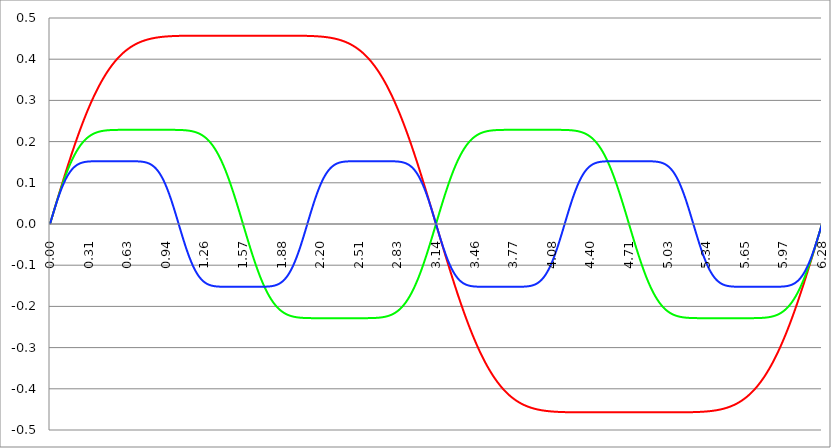
| Category | Series 1 | Series 0 | Series 2 |
|---|---|---|---|
| 0.0 | 0 | 0 | 0 |
| 0.00314159265358979 | 0.003 | 0.003 | 0.003 |
| 0.00628318530717958 | 0.006 | 0.006 | 0.006 |
| 0.00942477796076938 | 0.009 | 0.009 | 0.009 |
| 0.0125663706143592 | 0.013 | 0.013 | 0.013 |
| 0.015707963267949 | 0.016 | 0.016 | 0.016 |
| 0.0188495559215388 | 0.019 | 0.019 | 0.019 |
| 0.0219911485751285 | 0.022 | 0.022 | 0.022 |
| 0.0251327412287183 | 0.025 | 0.025 | 0.025 |
| 0.0282743338823081 | 0.028 | 0.028 | 0.028 |
| 0.0314159265358979 | 0.031 | 0.031 | 0.031 |
| 0.0345575191894877 | 0.035 | 0.034 | 0.034 |
| 0.0376991118430775 | 0.038 | 0.037 | 0.037 |
| 0.0408407044966673 | 0.041 | 0.041 | 0.04 |
| 0.0439822971502571 | 0.044 | 0.044 | 0.043 |
| 0.0471238898038469 | 0.047 | 0.047 | 0.046 |
| 0.0502654824574367 | 0.05 | 0.05 | 0.049 |
| 0.0534070751110265 | 0.053 | 0.053 | 0.052 |
| 0.0565486677646163 | 0.056 | 0.056 | 0.055 |
| 0.059690260418206 | 0.059 | 0.059 | 0.058 |
| 0.0628318530717958 | 0.063 | 0.062 | 0.06 |
| 0.0659734457253856 | 0.066 | 0.065 | 0.063 |
| 0.0691150383789754 | 0.069 | 0.068 | 0.066 |
| 0.0722566310325652 | 0.072 | 0.071 | 0.068 |
| 0.075398223686155 | 0.075 | 0.073 | 0.071 |
| 0.0785398163397448 | 0.078 | 0.076 | 0.074 |
| 0.0816814089933346 | 0.081 | 0.079 | 0.076 |
| 0.0848230016469244 | 0.084 | 0.082 | 0.079 |
| 0.0879645943005142 | 0.087 | 0.085 | 0.081 |
| 0.091106186954104 | 0.09 | 0.088 | 0.084 |
| 0.0942477796076937 | 0.093 | 0.09 | 0.086 |
| 0.0973893722612835 | 0.096 | 0.093 | 0.088 |
| 0.100530964914873 | 0.099 | 0.096 | 0.091 |
| 0.103672557568463 | 0.102 | 0.099 | 0.093 |
| 0.106814150222053 | 0.105 | 0.101 | 0.095 |
| 0.109955742875643 | 0.108 | 0.104 | 0.097 |
| 0.113097335529233 | 0.111 | 0.107 | 0.099 |
| 0.116238928182822 | 0.114 | 0.109 | 0.102 |
| 0.119380520836412 | 0.117 | 0.112 | 0.104 |
| 0.122522113490002 | 0.12 | 0.114 | 0.105 |
| 0.125663706143592 | 0.123 | 0.117 | 0.107 |
| 0.128805298797181 | 0.126 | 0.119 | 0.109 |
| 0.131946891450771 | 0.129 | 0.122 | 0.111 |
| 0.135088484104361 | 0.132 | 0.124 | 0.113 |
| 0.138230076757951 | 0.135 | 0.127 | 0.115 |
| 0.141371669411541 | 0.138 | 0.129 | 0.116 |
| 0.14451326206513 | 0.141 | 0.131 | 0.118 |
| 0.14765485471872 | 0.144 | 0.134 | 0.119 |
| 0.15079644737231 | 0.147 | 0.136 | 0.121 |
| 0.1539380400259 | 0.15 | 0.138 | 0.122 |
| 0.15707963267949 | 0.153 | 0.141 | 0.124 |
| 0.160221225333079 | 0.156 | 0.143 | 0.125 |
| 0.163362817986669 | 0.158 | 0.145 | 0.127 |
| 0.166504410640259 | 0.161 | 0.147 | 0.128 |
| 0.169646003293849 | 0.164 | 0.149 | 0.129 |
| 0.172787595947439 | 0.167 | 0.151 | 0.13 |
| 0.175929188601028 | 0.17 | 0.153 | 0.131 |
| 0.179070781254618 | 0.173 | 0.155 | 0.132 |
| 0.182212373908208 | 0.175 | 0.157 | 0.134 |
| 0.185353966561798 | 0.178 | 0.159 | 0.135 |
| 0.188495559215388 | 0.181 | 0.161 | 0.136 |
| 0.191637151868977 | 0.184 | 0.163 | 0.136 |
| 0.194778744522567 | 0.186 | 0.165 | 0.137 |
| 0.197920337176157 | 0.189 | 0.167 | 0.138 |
| 0.201061929829747 | 0.192 | 0.168 | 0.139 |
| 0.204203522483336 | 0.195 | 0.17 | 0.14 |
| 0.207345115136926 | 0.197 | 0.172 | 0.141 |
| 0.210486707790516 | 0.2 | 0.173 | 0.141 |
| 0.213628300444106 | 0.203 | 0.175 | 0.142 |
| 0.216769893097696 | 0.205 | 0.177 | 0.143 |
| 0.219911485751285 | 0.208 | 0.178 | 0.143 |
| 0.223053078404875 | 0.211 | 0.18 | 0.144 |
| 0.226194671058465 | 0.213 | 0.181 | 0.144 |
| 0.229336263712055 | 0.216 | 0.183 | 0.145 |
| 0.232477856365645 | 0.219 | 0.184 | 0.145 |
| 0.235619449019234 | 0.221 | 0.186 | 0.146 |
| 0.238761041672824 | 0.224 | 0.187 | 0.146 |
| 0.241902634326414 | 0.226 | 0.188 | 0.147 |
| 0.245044226980004 | 0.229 | 0.19 | 0.147 |
| 0.248185819633594 | 0.231 | 0.191 | 0.148 |
| 0.251327412287183 | 0.234 | 0.192 | 0.148 |
| 0.254469004940773 | 0.236 | 0.194 | 0.148 |
| 0.257610597594363 | 0.239 | 0.195 | 0.149 |
| 0.260752190247953 | 0.241 | 0.196 | 0.149 |
| 0.263893782901543 | 0.244 | 0.197 | 0.149 |
| 0.267035375555132 | 0.246 | 0.198 | 0.149 |
| 0.270176968208722 | 0.249 | 0.199 | 0.15 |
| 0.273318560862312 | 0.251 | 0.2 | 0.15 |
| 0.276460153515902 | 0.254 | 0.201 | 0.15 |
| 0.279601746169492 | 0.256 | 0.202 | 0.15 |
| 0.282743338823082 | 0.258 | 0.203 | 0.15 |
| 0.285884931476671 | 0.261 | 0.204 | 0.151 |
| 0.289026524130261 | 0.263 | 0.205 | 0.151 |
| 0.292168116783851 | 0.265 | 0.206 | 0.151 |
| 0.295309709437441 | 0.268 | 0.207 | 0.151 |
| 0.298451302091031 | 0.27 | 0.208 | 0.151 |
| 0.30159289474462 | 0.272 | 0.209 | 0.151 |
| 0.30473448739821 | 0.274 | 0.209 | 0.151 |
| 0.3078760800518 | 0.277 | 0.21 | 0.152 |
| 0.31101767270539 | 0.279 | 0.211 | 0.152 |
| 0.31415926535898 | 0.281 | 0.212 | 0.152 |
| 0.31730085801257 | 0.283 | 0.212 | 0.152 |
| 0.320442450666159 | 0.286 | 0.213 | 0.152 |
| 0.323584043319749 | 0.288 | 0.214 | 0.152 |
| 0.326725635973339 | 0.29 | 0.214 | 0.152 |
| 0.329867228626929 | 0.292 | 0.215 | 0.152 |
| 0.333008821280519 | 0.294 | 0.216 | 0.152 |
| 0.336150413934108 | 0.296 | 0.216 | 0.152 |
| 0.339292006587698 | 0.298 | 0.217 | 0.152 |
| 0.342433599241288 | 0.3 | 0.217 | 0.152 |
| 0.345575191894878 | 0.302 | 0.218 | 0.152 |
| 0.348716784548468 | 0.305 | 0.218 | 0.152 |
| 0.351858377202058 | 0.307 | 0.219 | 0.152 |
| 0.354999969855647 | 0.309 | 0.219 | 0.152 |
| 0.358141562509237 | 0.311 | 0.22 | 0.152 |
| 0.361283155162827 | 0.313 | 0.22 | 0.152 |
| 0.364424747816417 | 0.314 | 0.22 | 0.152 |
| 0.367566340470007 | 0.316 | 0.221 | 0.152 |
| 0.370707933123597 | 0.318 | 0.221 | 0.152 |
| 0.373849525777186 | 0.32 | 0.222 | 0.152 |
| 0.376991118430776 | 0.322 | 0.222 | 0.152 |
| 0.380132711084366 | 0.324 | 0.222 | 0.152 |
| 0.383274303737956 | 0.326 | 0.223 | 0.152 |
| 0.386415896391546 | 0.328 | 0.223 | 0.152 |
| 0.389557489045135 | 0.33 | 0.223 | 0.152 |
| 0.392699081698725 | 0.331 | 0.223 | 0.152 |
| 0.395840674352315 | 0.333 | 0.224 | 0.152 |
| 0.398982267005905 | 0.335 | 0.224 | 0.152 |
| 0.402123859659495 | 0.337 | 0.224 | 0.152 |
| 0.405265452313085 | 0.338 | 0.225 | 0.152 |
| 0.408407044966674 | 0.34 | 0.225 | 0.152 |
| 0.411548637620264 | 0.342 | 0.225 | 0.152 |
| 0.414690230273854 | 0.344 | 0.225 | 0.152 |
| 0.417831822927444 | 0.345 | 0.225 | 0.152 |
| 0.420973415581034 | 0.347 | 0.226 | 0.152 |
| 0.424115008234623 | 0.349 | 0.226 | 0.152 |
| 0.427256600888213 | 0.35 | 0.226 | 0.152 |
| 0.430398193541803 | 0.352 | 0.226 | 0.152 |
| 0.433539786195393 | 0.353 | 0.226 | 0.152 |
| 0.436681378848983 | 0.355 | 0.226 | 0.152 |
| 0.439822971502573 | 0.357 | 0.226 | 0.152 |
| 0.442964564156162 | 0.358 | 0.227 | 0.152 |
| 0.446106156809752 | 0.36 | 0.227 | 0.152 |
| 0.449247749463342 | 0.361 | 0.227 | 0.152 |
| 0.452389342116932 | 0.363 | 0.227 | 0.152 |
| 0.455530934770522 | 0.364 | 0.227 | 0.152 |
| 0.458672527424111 | 0.366 | 0.227 | 0.152 |
| 0.461814120077701 | 0.367 | 0.227 | 0.152 |
| 0.464955712731291 | 0.369 | 0.227 | 0.152 |
| 0.468097305384881 | 0.37 | 0.227 | 0.152 |
| 0.471238898038471 | 0.371 | 0.228 | 0.152 |
| 0.474380490692061 | 0.373 | 0.228 | 0.152 |
| 0.47752208334565 | 0.374 | 0.228 | 0.152 |
| 0.48066367599924 | 0.376 | 0.228 | 0.152 |
| 0.48380526865283 | 0.377 | 0.228 | 0.152 |
| 0.48694686130642 | 0.378 | 0.228 | 0.152 |
| 0.49008845396001 | 0.38 | 0.228 | 0.152 |
| 0.493230046613599 | 0.381 | 0.228 | 0.152 |
| 0.496371639267189 | 0.382 | 0.228 | 0.152 |
| 0.499513231920779 | 0.383 | 0.228 | 0.152 |
| 0.502654824574369 | 0.385 | 0.228 | 0.152 |
| 0.505796417227959 | 0.386 | 0.228 | 0.152 |
| 0.508938009881549 | 0.387 | 0.228 | 0.152 |
| 0.512079602535138 | 0.388 | 0.228 | 0.152 |
| 0.515221195188728 | 0.39 | 0.228 | 0.152 |
| 0.518362787842318 | 0.391 | 0.228 | 0.152 |
| 0.521504380495908 | 0.392 | 0.228 | 0.152 |
| 0.524645973149498 | 0.393 | 0.228 | 0.152 |
| 0.527787565803087 | 0.394 | 0.228 | 0.152 |
| 0.530929158456677 | 0.395 | 0.228 | 0.152 |
| 0.534070751110267 | 0.396 | 0.228 | 0.152 |
| 0.537212343763857 | 0.397 | 0.228 | 0.152 |
| 0.540353936417447 | 0.399 | 0.228 | 0.152 |
| 0.543495529071037 | 0.4 | 0.228 | 0.152 |
| 0.546637121724626 | 0.401 | 0.228 | 0.152 |
| 0.549778714378216 | 0.402 | 0.228 | 0.152 |
| 0.552920307031806 | 0.403 | 0.228 | 0.152 |
| 0.556061899685396 | 0.404 | 0.228 | 0.152 |
| 0.559203492338986 | 0.405 | 0.228 | 0.152 |
| 0.562345084992576 | 0.406 | 0.228 | 0.152 |
| 0.565486677646165 | 0.407 | 0.228 | 0.152 |
| 0.568628270299755 | 0.408 | 0.229 | 0.152 |
| 0.571769862953345 | 0.409 | 0.229 | 0.152 |
| 0.574911455606935 | 0.409 | 0.229 | 0.152 |
| 0.578053048260525 | 0.41 | 0.229 | 0.152 |
| 0.581194640914114 | 0.411 | 0.229 | 0.152 |
| 0.584336233567704 | 0.412 | 0.229 | 0.152 |
| 0.587477826221294 | 0.413 | 0.229 | 0.152 |
| 0.590619418874884 | 0.414 | 0.229 | 0.152 |
| 0.593761011528474 | 0.415 | 0.229 | 0.152 |
| 0.596902604182064 | 0.416 | 0.229 | 0.152 |
| 0.600044196835653 | 0.416 | 0.229 | 0.152 |
| 0.603185789489243 | 0.417 | 0.229 | 0.152 |
| 0.606327382142833 | 0.418 | 0.229 | 0.152 |
| 0.609468974796423 | 0.419 | 0.229 | 0.152 |
| 0.612610567450013 | 0.42 | 0.229 | 0.152 |
| 0.615752160103602 | 0.42 | 0.229 | 0.152 |
| 0.618893752757192 | 0.421 | 0.229 | 0.152 |
| 0.622035345410782 | 0.422 | 0.229 | 0.152 |
| 0.625176938064372 | 0.423 | 0.229 | 0.152 |
| 0.628318530717962 | 0.423 | 0.229 | 0.152 |
| 0.631460123371551 | 0.424 | 0.229 | 0.152 |
| 0.634601716025141 | 0.425 | 0.229 | 0.152 |
| 0.637743308678731 | 0.425 | 0.229 | 0.152 |
| 0.640884901332321 | 0.426 | 0.229 | 0.152 |
| 0.644026493985911 | 0.427 | 0.229 | 0.152 |
| 0.647168086639501 | 0.427 | 0.229 | 0.152 |
| 0.65030967929309 | 0.428 | 0.229 | 0.152 |
| 0.65345127194668 | 0.429 | 0.229 | 0.152 |
| 0.65659286460027 | 0.429 | 0.229 | 0.152 |
| 0.65973445725386 | 0.43 | 0.229 | 0.152 |
| 0.66287604990745 | 0.431 | 0.229 | 0.152 |
| 0.666017642561039 | 0.431 | 0.229 | 0.152 |
| 0.669159235214629 | 0.432 | 0.229 | 0.152 |
| 0.672300827868219 | 0.432 | 0.229 | 0.152 |
| 0.675442420521809 | 0.433 | 0.229 | 0.152 |
| 0.678584013175399 | 0.433 | 0.229 | 0.152 |
| 0.681725605828989 | 0.434 | 0.229 | 0.152 |
| 0.684867198482578 | 0.434 | 0.229 | 0.152 |
| 0.688008791136168 | 0.435 | 0.229 | 0.152 |
| 0.691150383789758 | 0.435 | 0.229 | 0.152 |
| 0.694291976443348 | 0.436 | 0.229 | 0.152 |
| 0.697433569096938 | 0.436 | 0.229 | 0.152 |
| 0.700575161750528 | 0.437 | 0.229 | 0.152 |
| 0.703716754404117 | 0.437 | 0.229 | 0.152 |
| 0.706858347057707 | 0.438 | 0.229 | 0.152 |
| 0.709999939711297 | 0.438 | 0.229 | 0.152 |
| 0.713141532364887 | 0.439 | 0.229 | 0.152 |
| 0.716283125018477 | 0.439 | 0.229 | 0.152 |
| 0.719424717672066 | 0.44 | 0.229 | 0.152 |
| 0.722566310325656 | 0.44 | 0.229 | 0.152 |
| 0.725707902979246 | 0.441 | 0.229 | 0.152 |
| 0.728849495632836 | 0.441 | 0.229 | 0.152 |
| 0.731991088286426 | 0.441 | 0.229 | 0.152 |
| 0.735132680940016 | 0.442 | 0.229 | 0.152 |
| 0.738274273593605 | 0.442 | 0.229 | 0.152 |
| 0.741415866247195 | 0.442 | 0.229 | 0.151 |
| 0.744557458900785 | 0.443 | 0.229 | 0.151 |
| 0.747699051554375 | 0.443 | 0.229 | 0.151 |
| 0.750840644207965 | 0.444 | 0.229 | 0.151 |
| 0.753982236861554 | 0.444 | 0.229 | 0.151 |
| 0.757123829515144 | 0.444 | 0.229 | 0.151 |
| 0.760265422168734 | 0.445 | 0.229 | 0.151 |
| 0.763407014822324 | 0.445 | 0.229 | 0.151 |
| 0.766548607475914 | 0.445 | 0.229 | 0.15 |
| 0.769690200129504 | 0.446 | 0.229 | 0.15 |
| 0.772831792783093 | 0.446 | 0.229 | 0.15 |
| 0.775973385436683 | 0.446 | 0.229 | 0.15 |
| 0.779114978090273 | 0.446 | 0.229 | 0.15 |
| 0.782256570743863 | 0.447 | 0.229 | 0.149 |
| 0.785398163397453 | 0.447 | 0.229 | 0.149 |
| 0.788539756051042 | 0.447 | 0.229 | 0.149 |
| 0.791681348704632 | 0.448 | 0.229 | 0.148 |
| 0.794822941358222 | 0.448 | 0.229 | 0.148 |
| 0.797964534011812 | 0.448 | 0.229 | 0.148 |
| 0.801106126665402 | 0.448 | 0.229 | 0.147 |
| 0.804247719318992 | 0.449 | 0.229 | 0.147 |
| 0.807389311972581 | 0.449 | 0.229 | 0.147 |
| 0.810530904626171 | 0.449 | 0.229 | 0.146 |
| 0.813672497279761 | 0.449 | 0.229 | 0.146 |
| 0.816814089933351 | 0.449 | 0.229 | 0.145 |
| 0.819955682586941 | 0.45 | 0.229 | 0.145 |
| 0.823097275240531 | 0.45 | 0.229 | 0.144 |
| 0.82623886789412 | 0.45 | 0.229 | 0.144 |
| 0.82938046054771 | 0.45 | 0.229 | 0.143 |
| 0.8325220532013 | 0.451 | 0.229 | 0.142 |
| 0.83566364585489 | 0.451 | 0.229 | 0.142 |
| 0.83880523850848 | 0.451 | 0.229 | 0.141 |
| 0.841946831162069 | 0.451 | 0.229 | 0.14 |
| 0.845088423815659 | 0.451 | 0.229 | 0.139 |
| 0.848230016469249 | 0.451 | 0.229 | 0.139 |
| 0.851371609122839 | 0.452 | 0.229 | 0.138 |
| 0.854513201776429 | 0.452 | 0.229 | 0.137 |
| 0.857654794430019 | 0.452 | 0.229 | 0.136 |
| 0.860796387083608 | 0.452 | 0.229 | 0.135 |
| 0.863937979737198 | 0.452 | 0.229 | 0.134 |
| 0.867079572390788 | 0.452 | 0.229 | 0.133 |
| 0.870221165044378 | 0.453 | 0.229 | 0.132 |
| 0.873362757697968 | 0.453 | 0.229 | 0.131 |
| 0.876504350351557 | 0.453 | 0.229 | 0.129 |
| 0.879645943005147 | 0.453 | 0.229 | 0.128 |
| 0.882787535658737 | 0.453 | 0.229 | 0.127 |
| 0.885929128312327 | 0.453 | 0.229 | 0.126 |
| 0.889070720965917 | 0.453 | 0.229 | 0.124 |
| 0.892212313619507 | 0.453 | 0.229 | 0.123 |
| 0.895353906273096 | 0.454 | 0.229 | 0.121 |
| 0.898495498926686 | 0.454 | 0.229 | 0.12 |
| 0.901637091580276 | 0.454 | 0.229 | 0.118 |
| 0.904778684233866 | 0.454 | 0.229 | 0.117 |
| 0.907920276887456 | 0.454 | 0.229 | 0.115 |
| 0.911061869541045 | 0.454 | 0.229 | 0.113 |
| 0.914203462194635 | 0.454 | 0.229 | 0.112 |
| 0.917345054848225 | 0.454 | 0.229 | 0.11 |
| 0.920486647501815 | 0.454 | 0.229 | 0.108 |
| 0.923628240155405 | 0.455 | 0.229 | 0.106 |
| 0.926769832808995 | 0.455 | 0.229 | 0.104 |
| 0.929911425462584 | 0.455 | 0.229 | 0.102 |
| 0.933053018116174 | 0.455 | 0.229 | 0.1 |
| 0.936194610769764 | 0.455 | 0.229 | 0.098 |
| 0.939336203423354 | 0.455 | 0.229 | 0.096 |
| 0.942477796076944 | 0.455 | 0.229 | 0.094 |
| 0.945619388730533 | 0.455 | 0.229 | 0.091 |
| 0.948760981384123 | 0.455 | 0.229 | 0.089 |
| 0.951902574037713 | 0.455 | 0.229 | 0.087 |
| 0.955044166691303 | 0.455 | 0.229 | 0.085 |
| 0.958185759344893 | 0.455 | 0.229 | 0.082 |
| 0.961327351998483 | 0.455 | 0.229 | 0.08 |
| 0.964468944652072 | 0.456 | 0.229 | 0.077 |
| 0.967610537305662 | 0.456 | 0.229 | 0.075 |
| 0.970752129959252 | 0.456 | 0.229 | 0.072 |
| 0.973893722612842 | 0.456 | 0.229 | 0.069 |
| 0.977035315266432 | 0.456 | 0.229 | 0.067 |
| 0.980176907920022 | 0.456 | 0.229 | 0.064 |
| 0.983318500573611 | 0.456 | 0.229 | 0.061 |
| 0.986460093227201 | 0.456 | 0.229 | 0.058 |
| 0.989601685880791 | 0.456 | 0.229 | 0.056 |
| 0.992743278534381 | 0.456 | 0.229 | 0.053 |
| 0.995884871187971 | 0.456 | 0.229 | 0.05 |
| 0.99902646384156 | 0.456 | 0.229 | 0.047 |
| 1.00216805649515 | 0.456 | 0.229 | 0.044 |
| 1.00530964914874 | 0.456 | 0.228 | 0.041 |
| 1.00845124180233 | 0.456 | 0.228 | 0.038 |
| 1.01159283445592 | 0.456 | 0.228 | 0.035 |
| 1.01473442710951 | 0.456 | 0.228 | 0.032 |
| 1.017876019763099 | 0.456 | 0.228 | 0.029 |
| 1.021017612416689 | 0.456 | 0.228 | 0.026 |
| 1.02415920507028 | 0.456 | 0.228 | 0.023 |
| 1.027300797723869 | 0.456 | 0.228 | 0.02 |
| 1.030442390377459 | 0.456 | 0.228 | 0.017 |
| 1.033583983031048 | 0.456 | 0.228 | 0.014 |
| 1.036725575684638 | 0.457 | 0.228 | 0.01 |
| 1.039867168338228 | 0.457 | 0.228 | 0.007 |
| 1.043008760991818 | 0.457 | 0.228 | 0.004 |
| 1.046150353645408 | 0.457 | 0.228 | 0.001 |
| 1.049291946298998 | 0.457 | 0.228 | -0.002 |
| 1.052433538952587 | 0.457 | 0.228 | -0.005 |
| 1.055575131606177 | 0.457 | 0.228 | -0.008 |
| 1.058716724259767 | 0.457 | 0.228 | -0.012 |
| 1.061858316913357 | 0.457 | 0.228 | -0.015 |
| 1.064999909566947 | 0.457 | 0.228 | -0.018 |
| 1.068141502220536 | 0.457 | 0.228 | -0.021 |
| 1.071283094874126 | 0.457 | 0.228 | -0.024 |
| 1.074424687527716 | 0.457 | 0.228 | -0.027 |
| 1.077566280181306 | 0.457 | 0.228 | -0.03 |
| 1.080707872834896 | 0.457 | 0.228 | -0.033 |
| 1.083849465488486 | 0.457 | 0.228 | -0.036 |
| 1.086991058142075 | 0.457 | 0.228 | -0.039 |
| 1.090132650795665 | 0.457 | 0.228 | -0.042 |
| 1.093274243449255 | 0.457 | 0.228 | -0.045 |
| 1.096415836102845 | 0.457 | 0.228 | -0.048 |
| 1.099557428756435 | 0.457 | 0.228 | -0.051 |
| 1.102699021410025 | 0.457 | 0.227 | -0.054 |
| 1.105840614063614 | 0.457 | 0.227 | -0.057 |
| 1.108982206717204 | 0.457 | 0.227 | -0.059 |
| 1.112123799370794 | 0.457 | 0.227 | -0.062 |
| 1.115265392024384 | 0.457 | 0.227 | -0.065 |
| 1.118406984677974 | 0.457 | 0.227 | -0.068 |
| 1.121548577331563 | 0.457 | 0.227 | -0.07 |
| 1.124690169985153 | 0.457 | 0.227 | -0.073 |
| 1.127831762638743 | 0.457 | 0.227 | -0.075 |
| 1.130973355292333 | 0.457 | 0.226 | -0.078 |
| 1.134114947945923 | 0.457 | 0.226 | -0.08 |
| 1.137256540599513 | 0.457 | 0.226 | -0.083 |
| 1.140398133253102 | 0.457 | 0.226 | -0.085 |
| 1.143539725906692 | 0.457 | 0.226 | -0.088 |
| 1.146681318560282 | 0.457 | 0.226 | -0.09 |
| 1.149822911213872 | 0.457 | 0.226 | -0.092 |
| 1.152964503867462 | 0.457 | 0.225 | -0.094 |
| 1.156106096521051 | 0.457 | 0.225 | -0.097 |
| 1.159247689174641 | 0.457 | 0.225 | -0.099 |
| 1.162389281828231 | 0.457 | 0.225 | -0.101 |
| 1.165530874481821 | 0.457 | 0.225 | -0.103 |
| 1.168672467135411 | 0.457 | 0.224 | -0.105 |
| 1.171814059789001 | 0.457 | 0.224 | -0.107 |
| 1.17495565244259 | 0.457 | 0.224 | -0.109 |
| 1.17809724509618 | 0.457 | 0.223 | -0.11 |
| 1.18123883774977 | 0.457 | 0.223 | -0.112 |
| 1.18438043040336 | 0.457 | 0.223 | -0.114 |
| 1.18752202305695 | 0.457 | 0.223 | -0.116 |
| 1.190663615710539 | 0.457 | 0.222 | -0.117 |
| 1.193805208364129 | 0.457 | 0.222 | -0.119 |
| 1.19694680101772 | 0.457 | 0.222 | -0.12 |
| 1.200088393671309 | 0.457 | 0.221 | -0.122 |
| 1.203229986324899 | 0.457 | 0.221 | -0.123 |
| 1.206371578978489 | 0.457 | 0.22 | -0.125 |
| 1.209513171632078 | 0.457 | 0.22 | -0.126 |
| 1.212654764285668 | 0.457 | 0.22 | -0.127 |
| 1.215796356939258 | 0.457 | 0.219 | -0.129 |
| 1.218937949592848 | 0.457 | 0.219 | -0.13 |
| 1.222079542246438 | 0.457 | 0.218 | -0.131 |
| 1.225221134900027 | 0.457 | 0.218 | -0.132 |
| 1.228362727553617 | 0.457 | 0.217 | -0.133 |
| 1.231504320207207 | 0.457 | 0.217 | -0.134 |
| 1.234645912860797 | 0.457 | 0.216 | -0.135 |
| 1.237787505514387 | 0.457 | 0.216 | -0.136 |
| 1.240929098167977 | 0.457 | 0.215 | -0.137 |
| 1.244070690821566 | 0.457 | 0.214 | -0.138 |
| 1.247212283475156 | 0.457 | 0.214 | -0.139 |
| 1.250353876128746 | 0.457 | 0.213 | -0.14 |
| 1.253495468782336 | 0.457 | 0.212 | -0.14 |
| 1.256637061435926 | 0.457 | 0.212 | -0.141 |
| 1.259778654089515 | 0.457 | 0.211 | -0.142 |
| 1.262920246743105 | 0.457 | 0.21 | -0.142 |
| 1.266061839396695 | 0.457 | 0.209 | -0.143 |
| 1.269203432050285 | 0.457 | 0.209 | -0.144 |
| 1.272345024703875 | 0.457 | 0.208 | -0.144 |
| 1.275486617357465 | 0.457 | 0.207 | -0.145 |
| 1.278628210011054 | 0.457 | 0.206 | -0.145 |
| 1.281769802664644 | 0.457 | 0.205 | -0.146 |
| 1.284911395318234 | 0.457 | 0.204 | -0.146 |
| 1.288052987971824 | 0.457 | 0.203 | -0.147 |
| 1.291194580625414 | 0.457 | 0.202 | -0.147 |
| 1.294336173279003 | 0.457 | 0.201 | -0.147 |
| 1.297477765932593 | 0.457 | 0.2 | -0.148 |
| 1.300619358586183 | 0.457 | 0.199 | -0.148 |
| 1.303760951239773 | 0.457 | 0.198 | -0.149 |
| 1.306902543893363 | 0.457 | 0.197 | -0.149 |
| 1.310044136546953 | 0.457 | 0.196 | -0.149 |
| 1.313185729200542 | 0.457 | 0.195 | -0.149 |
| 1.316327321854132 | 0.457 | 0.194 | -0.15 |
| 1.319468914507722 | 0.457 | 0.192 | -0.15 |
| 1.322610507161312 | 0.457 | 0.191 | -0.15 |
| 1.325752099814902 | 0.457 | 0.19 | -0.15 |
| 1.328893692468491 | 0.457 | 0.188 | -0.15 |
| 1.332035285122081 | 0.457 | 0.187 | -0.151 |
| 1.335176877775671 | 0.457 | 0.186 | -0.151 |
| 1.338318470429261 | 0.457 | 0.184 | -0.151 |
| 1.341460063082851 | 0.457 | 0.183 | -0.151 |
| 1.344601655736441 | 0.457 | 0.181 | -0.151 |
| 1.34774324839003 | 0.457 | 0.18 | -0.151 |
| 1.35088484104362 | 0.457 | 0.178 | -0.151 |
| 1.35402643369721 | 0.457 | 0.177 | -0.151 |
| 1.3571680263508 | 0.457 | 0.175 | -0.152 |
| 1.36030961900439 | 0.457 | 0.173 | -0.152 |
| 1.363451211657979 | 0.457 | 0.172 | -0.152 |
| 1.36659280431157 | 0.457 | 0.17 | -0.152 |
| 1.369734396965159 | 0.457 | 0.168 | -0.152 |
| 1.372875989618749 | 0.457 | 0.167 | -0.152 |
| 1.376017582272339 | 0.457 | 0.165 | -0.152 |
| 1.379159174925929 | 0.457 | 0.163 | -0.152 |
| 1.382300767579518 | 0.457 | 0.161 | -0.152 |
| 1.385442360233108 | 0.457 | 0.159 | -0.152 |
| 1.388583952886698 | 0.457 | 0.157 | -0.152 |
| 1.391725545540288 | 0.457 | 0.155 | -0.152 |
| 1.394867138193878 | 0.457 | 0.153 | -0.152 |
| 1.398008730847468 | 0.457 | 0.151 | -0.152 |
| 1.401150323501057 | 0.457 | 0.149 | -0.152 |
| 1.404291916154647 | 0.457 | 0.147 | -0.152 |
| 1.407433508808237 | 0.457 | 0.145 | -0.152 |
| 1.410575101461827 | 0.457 | 0.143 | -0.152 |
| 1.413716694115417 | 0.457 | 0.141 | -0.152 |
| 1.416858286769006 | 0.457 | 0.138 | -0.152 |
| 1.419999879422596 | 0.457 | 0.136 | -0.152 |
| 1.423141472076186 | 0.457 | 0.134 | -0.152 |
| 1.426283064729776 | 0.457 | 0.131 | -0.152 |
| 1.429424657383366 | 0.457 | 0.129 | -0.152 |
| 1.432566250036956 | 0.457 | 0.127 | -0.152 |
| 1.435707842690545 | 0.457 | 0.124 | -0.152 |
| 1.438849435344135 | 0.457 | 0.122 | -0.152 |
| 1.441991027997725 | 0.457 | 0.119 | -0.152 |
| 1.445132620651315 | 0.457 | 0.117 | -0.152 |
| 1.448274213304905 | 0.457 | 0.114 | -0.152 |
| 1.451415805958494 | 0.457 | 0.112 | -0.152 |
| 1.454557398612084 | 0.457 | 0.109 | -0.152 |
| 1.457698991265674 | 0.457 | 0.107 | -0.152 |
| 1.460840583919264 | 0.457 | 0.104 | -0.152 |
| 1.463982176572854 | 0.457 | 0.101 | -0.152 |
| 1.467123769226444 | 0.457 | 0.099 | -0.152 |
| 1.470265361880033 | 0.457 | 0.096 | -0.152 |
| 1.473406954533623 | 0.457 | 0.093 | -0.152 |
| 1.476548547187213 | 0.457 | 0.09 | -0.152 |
| 1.479690139840803 | 0.457 | 0.088 | -0.152 |
| 1.482831732494393 | 0.457 | 0.085 | -0.152 |
| 1.485973325147982 | 0.457 | 0.082 | -0.152 |
| 1.489114917801572 | 0.457 | 0.079 | -0.152 |
| 1.492256510455162 | 0.457 | 0.076 | -0.152 |
| 1.495398103108752 | 0.457 | 0.073 | -0.152 |
| 1.498539695762342 | 0.457 | 0.071 | -0.152 |
| 1.501681288415932 | 0.457 | 0.068 | -0.152 |
| 1.504822881069521 | 0.457 | 0.065 | -0.152 |
| 1.507964473723111 | 0.457 | 0.062 | -0.152 |
| 1.511106066376701 | 0.457 | 0.059 | -0.152 |
| 1.514247659030291 | 0.457 | 0.056 | -0.152 |
| 1.517389251683881 | 0.457 | 0.053 | -0.152 |
| 1.520530844337471 | 0.457 | 0.05 | -0.152 |
| 1.52367243699106 | 0.457 | 0.047 | -0.152 |
| 1.52681402964465 | 0.457 | 0.044 | -0.152 |
| 1.52995562229824 | 0.457 | 0.041 | -0.152 |
| 1.53309721495183 | 0.457 | 0.037 | -0.152 |
| 1.53623880760542 | 0.457 | 0.034 | -0.152 |
| 1.539380400259009 | 0.457 | 0.031 | -0.152 |
| 1.542521992912599 | 0.457 | 0.028 | -0.152 |
| 1.545663585566189 | 0.457 | 0.025 | -0.152 |
| 1.548805178219779 | 0.457 | 0.022 | -0.152 |
| 1.551946770873369 | 0.457 | 0.019 | -0.152 |
| 1.555088363526959 | 0.457 | 0.016 | -0.152 |
| 1.558229956180548 | 0.457 | 0.013 | -0.152 |
| 1.561371548834138 | 0.457 | 0.009 | -0.152 |
| 1.564513141487728 | 0.457 | 0.006 | -0.152 |
| 1.567654734141318 | 0.457 | 0.003 | -0.152 |
| 1.570796326794908 | 0.457 | 0 | -0.152 |
| 1.573937919448497 | 0.457 | -0.003 | -0.152 |
| 1.577079512102087 | 0.457 | -0.006 | -0.152 |
| 1.580221104755677 | 0.457 | -0.009 | -0.152 |
| 1.583362697409267 | 0.457 | -0.013 | -0.152 |
| 1.586504290062857 | 0.457 | -0.016 | -0.152 |
| 1.589645882716447 | 0.457 | -0.019 | -0.152 |
| 1.592787475370036 | 0.457 | -0.022 | -0.152 |
| 1.595929068023626 | 0.457 | -0.025 | -0.152 |
| 1.599070660677216 | 0.457 | -0.028 | -0.152 |
| 1.602212253330806 | 0.457 | -0.031 | -0.152 |
| 1.605353845984396 | 0.457 | -0.034 | -0.152 |
| 1.608495438637985 | 0.457 | -0.037 | -0.152 |
| 1.611637031291575 | 0.457 | -0.041 | -0.152 |
| 1.614778623945165 | 0.457 | -0.044 | -0.152 |
| 1.617920216598755 | 0.457 | -0.047 | -0.152 |
| 1.621061809252345 | 0.457 | -0.05 | -0.152 |
| 1.624203401905935 | 0.457 | -0.053 | -0.152 |
| 1.627344994559524 | 0.457 | -0.056 | -0.152 |
| 1.630486587213114 | 0.457 | -0.059 | -0.152 |
| 1.633628179866704 | 0.457 | -0.062 | -0.152 |
| 1.636769772520294 | 0.457 | -0.065 | -0.152 |
| 1.639911365173884 | 0.457 | -0.068 | -0.152 |
| 1.643052957827473 | 0.457 | -0.071 | -0.152 |
| 1.646194550481063 | 0.457 | -0.073 | -0.152 |
| 1.649336143134653 | 0.457 | -0.076 | -0.152 |
| 1.652477735788243 | 0.457 | -0.079 | -0.152 |
| 1.655619328441833 | 0.457 | -0.082 | -0.152 |
| 1.658760921095423 | 0.457 | -0.085 | -0.152 |
| 1.661902513749012 | 0.457 | -0.088 | -0.152 |
| 1.665044106402602 | 0.457 | -0.09 | -0.152 |
| 1.668185699056192 | 0.457 | -0.093 | -0.152 |
| 1.671327291709782 | 0.457 | -0.096 | -0.152 |
| 1.674468884363372 | 0.457 | -0.099 | -0.152 |
| 1.677610477016961 | 0.457 | -0.101 | -0.152 |
| 1.680752069670551 | 0.457 | -0.104 | -0.152 |
| 1.683893662324141 | 0.457 | -0.107 | -0.152 |
| 1.687035254977731 | 0.457 | -0.109 | -0.152 |
| 1.690176847631321 | 0.457 | -0.112 | -0.152 |
| 1.693318440284911 | 0.457 | -0.114 | -0.152 |
| 1.6964600329385 | 0.457 | -0.117 | -0.152 |
| 1.69960162559209 | 0.457 | -0.119 | -0.152 |
| 1.70274321824568 | 0.457 | -0.122 | -0.152 |
| 1.70588481089927 | 0.457 | -0.124 | -0.152 |
| 1.70902640355286 | 0.457 | -0.127 | -0.152 |
| 1.712167996206449 | 0.457 | -0.129 | -0.152 |
| 1.715309588860039 | 0.457 | -0.131 | -0.152 |
| 1.71845118151363 | 0.457 | -0.134 | -0.152 |
| 1.721592774167219 | 0.457 | -0.136 | -0.152 |
| 1.724734366820809 | 0.457 | -0.138 | -0.152 |
| 1.727875959474399 | 0.457 | -0.141 | -0.152 |
| 1.731017552127988 | 0.457 | -0.143 | -0.152 |
| 1.734159144781578 | 0.457 | -0.145 | -0.152 |
| 1.737300737435168 | 0.457 | -0.147 | -0.152 |
| 1.740442330088758 | 0.457 | -0.149 | -0.152 |
| 1.743583922742348 | 0.457 | -0.151 | -0.152 |
| 1.746725515395937 | 0.457 | -0.153 | -0.152 |
| 1.749867108049527 | 0.457 | -0.155 | -0.152 |
| 1.753008700703117 | 0.457 | -0.157 | -0.152 |
| 1.756150293356707 | 0.457 | -0.159 | -0.152 |
| 1.759291886010297 | 0.457 | -0.161 | -0.152 |
| 1.762433478663887 | 0.457 | -0.163 | -0.152 |
| 1.765575071317476 | 0.457 | -0.165 | -0.152 |
| 1.768716663971066 | 0.457 | -0.167 | -0.152 |
| 1.771858256624656 | 0.457 | -0.168 | -0.152 |
| 1.774999849278246 | 0.457 | -0.17 | -0.152 |
| 1.778141441931836 | 0.457 | -0.172 | -0.152 |
| 1.781283034585426 | 0.457 | -0.173 | -0.152 |
| 1.784424627239015 | 0.457 | -0.175 | -0.152 |
| 1.787566219892605 | 0.457 | -0.177 | -0.151 |
| 1.790707812546195 | 0.457 | -0.178 | -0.151 |
| 1.793849405199785 | 0.457 | -0.18 | -0.151 |
| 1.796990997853375 | 0.457 | -0.181 | -0.151 |
| 1.800132590506964 | 0.457 | -0.183 | -0.151 |
| 1.803274183160554 | 0.457 | -0.184 | -0.151 |
| 1.806415775814144 | 0.457 | -0.186 | -0.151 |
| 1.809557368467734 | 0.457 | -0.187 | -0.151 |
| 1.812698961121324 | 0.457 | -0.188 | -0.15 |
| 1.815840553774914 | 0.457 | -0.19 | -0.15 |
| 1.818982146428503 | 0.457 | -0.191 | -0.15 |
| 1.822123739082093 | 0.457 | -0.192 | -0.15 |
| 1.825265331735683 | 0.457 | -0.194 | -0.15 |
| 1.828406924389273 | 0.457 | -0.195 | -0.149 |
| 1.831548517042863 | 0.457 | -0.196 | -0.149 |
| 1.834690109696452 | 0.457 | -0.197 | -0.149 |
| 1.837831702350042 | 0.457 | -0.198 | -0.149 |
| 1.840973295003632 | 0.457 | -0.199 | -0.148 |
| 1.844114887657222 | 0.457 | -0.2 | -0.148 |
| 1.847256480310812 | 0.457 | -0.201 | -0.147 |
| 1.850398072964402 | 0.457 | -0.202 | -0.147 |
| 1.853539665617991 | 0.457 | -0.203 | -0.147 |
| 1.856681258271581 | 0.457 | -0.204 | -0.146 |
| 1.859822850925171 | 0.457 | -0.205 | -0.146 |
| 1.862964443578761 | 0.457 | -0.206 | -0.145 |
| 1.866106036232351 | 0.457 | -0.207 | -0.145 |
| 1.86924762888594 | 0.457 | -0.208 | -0.144 |
| 1.87238922153953 | 0.457 | -0.209 | -0.144 |
| 1.87553081419312 | 0.457 | -0.209 | -0.143 |
| 1.87867240684671 | 0.457 | -0.21 | -0.142 |
| 1.8818139995003 | 0.457 | -0.211 | -0.142 |
| 1.88495559215389 | 0.457 | -0.212 | -0.141 |
| 1.888097184807479 | 0.457 | -0.212 | -0.14 |
| 1.891238777461069 | 0.457 | -0.213 | -0.14 |
| 1.89438037011466 | 0.457 | -0.214 | -0.139 |
| 1.897521962768249 | 0.457 | -0.214 | -0.138 |
| 1.900663555421839 | 0.457 | -0.215 | -0.137 |
| 1.903805148075429 | 0.457 | -0.216 | -0.136 |
| 1.906946740729018 | 0.457 | -0.216 | -0.135 |
| 1.910088333382608 | 0.457 | -0.217 | -0.134 |
| 1.913229926036198 | 0.457 | -0.217 | -0.133 |
| 1.916371518689788 | 0.457 | -0.218 | -0.132 |
| 1.919513111343378 | 0.457 | -0.218 | -0.131 |
| 1.922654703996967 | 0.457 | -0.219 | -0.13 |
| 1.925796296650557 | 0.457 | -0.219 | -0.129 |
| 1.928937889304147 | 0.457 | -0.22 | -0.127 |
| 1.932079481957737 | 0.457 | -0.22 | -0.126 |
| 1.935221074611327 | 0.457 | -0.22 | -0.125 |
| 1.938362667264917 | 0.457 | -0.221 | -0.123 |
| 1.941504259918506 | 0.457 | -0.221 | -0.122 |
| 1.944645852572096 | 0.457 | -0.222 | -0.12 |
| 1.947787445225686 | 0.457 | -0.222 | -0.119 |
| 1.950929037879276 | 0.457 | -0.222 | -0.117 |
| 1.954070630532866 | 0.457 | -0.223 | -0.116 |
| 1.957212223186455 | 0.457 | -0.223 | -0.114 |
| 1.960353815840045 | 0.457 | -0.223 | -0.112 |
| 1.963495408493635 | 0.457 | -0.223 | -0.11 |
| 1.966637001147225 | 0.457 | -0.224 | -0.109 |
| 1.969778593800815 | 0.457 | -0.224 | -0.107 |
| 1.972920186454405 | 0.457 | -0.224 | -0.105 |
| 1.976061779107994 | 0.457 | -0.225 | -0.103 |
| 1.979203371761584 | 0.457 | -0.225 | -0.101 |
| 1.982344964415174 | 0.457 | -0.225 | -0.099 |
| 1.985486557068764 | 0.457 | -0.225 | -0.097 |
| 1.988628149722354 | 0.457 | -0.225 | -0.094 |
| 1.991769742375943 | 0.457 | -0.226 | -0.092 |
| 1.994911335029533 | 0.457 | -0.226 | -0.09 |
| 1.998052927683123 | 0.457 | -0.226 | -0.088 |
| 2.001194520336712 | 0.457 | -0.226 | -0.085 |
| 2.004336112990302 | 0.457 | -0.226 | -0.083 |
| 2.007477705643892 | 0.457 | -0.226 | -0.08 |
| 2.010619298297482 | 0.457 | -0.226 | -0.078 |
| 2.013760890951071 | 0.457 | -0.227 | -0.075 |
| 2.016902483604661 | 0.457 | -0.227 | -0.073 |
| 2.02004407625825 | 0.457 | -0.227 | -0.07 |
| 2.02318566891184 | 0.457 | -0.227 | -0.068 |
| 2.02632726156543 | 0.457 | -0.227 | -0.065 |
| 2.029468854219019 | 0.457 | -0.227 | -0.062 |
| 2.032610446872609 | 0.457 | -0.227 | -0.059 |
| 2.035752039526198 | 0.457 | -0.227 | -0.057 |
| 2.038893632179788 | 0.457 | -0.227 | -0.054 |
| 2.042035224833378 | 0.457 | -0.228 | -0.051 |
| 2.045176817486967 | 0.457 | -0.228 | -0.048 |
| 2.048318410140557 | 0.457 | -0.228 | -0.045 |
| 2.051460002794146 | 0.457 | -0.228 | -0.042 |
| 2.054601595447736 | 0.457 | -0.228 | -0.039 |
| 2.057743188101325 | 0.457 | -0.228 | -0.036 |
| 2.060884780754915 | 0.457 | -0.228 | -0.033 |
| 2.064026373408505 | 0.457 | -0.228 | -0.03 |
| 2.067167966062094 | 0.457 | -0.228 | -0.027 |
| 2.070309558715684 | 0.457 | -0.228 | -0.024 |
| 2.073451151369273 | 0.457 | -0.228 | -0.021 |
| 2.076592744022863 | 0.457 | -0.228 | -0.018 |
| 2.079734336676452 | 0.457 | -0.228 | -0.015 |
| 2.082875929330042 | 0.457 | -0.228 | -0.012 |
| 2.086017521983632 | 0.457 | -0.228 | -0.008 |
| 2.089159114637221 | 0.457 | -0.228 | -0.005 |
| 2.092300707290811 | 0.457 | -0.228 | -0.002 |
| 2.095442299944401 | 0.457 | -0.228 | 0.001 |
| 2.09858389259799 | 0.457 | -0.228 | 0.004 |
| 2.10172548525158 | 0.457 | -0.228 | 0.007 |
| 2.104867077905169 | 0.457 | -0.228 | 0.01 |
| 2.108008670558759 | 0.456 | -0.228 | 0.014 |
| 2.111150263212349 | 0.456 | -0.228 | 0.017 |
| 2.114291855865938 | 0.456 | -0.228 | 0.02 |
| 2.117433448519528 | 0.456 | -0.228 | 0.023 |
| 2.120575041173117 | 0.456 | -0.228 | 0.026 |
| 2.123716633826707 | 0.456 | -0.228 | 0.029 |
| 2.126858226480297 | 0.456 | -0.228 | 0.032 |
| 2.129999819133886 | 0.456 | -0.228 | 0.035 |
| 2.133141411787476 | 0.456 | -0.228 | 0.038 |
| 2.136283004441065 | 0.456 | -0.228 | 0.041 |
| 2.139424597094655 | 0.456 | -0.229 | 0.044 |
| 2.142566189748245 | 0.456 | -0.229 | 0.047 |
| 2.145707782401834 | 0.456 | -0.229 | 0.05 |
| 2.148849375055424 | 0.456 | -0.229 | 0.053 |
| 2.151990967709013 | 0.456 | -0.229 | 0.056 |
| 2.155132560362603 | 0.456 | -0.229 | 0.058 |
| 2.158274153016193 | 0.456 | -0.229 | 0.061 |
| 2.161415745669782 | 0.456 | -0.229 | 0.064 |
| 2.164557338323372 | 0.456 | -0.229 | 0.067 |
| 2.167698930976961 | 0.456 | -0.229 | 0.069 |
| 2.170840523630551 | 0.456 | -0.229 | 0.072 |
| 2.173982116284141 | 0.456 | -0.229 | 0.075 |
| 2.17712370893773 | 0.456 | -0.229 | 0.077 |
| 2.18026530159132 | 0.455 | -0.229 | 0.08 |
| 2.183406894244909 | 0.455 | -0.229 | 0.082 |
| 2.186548486898499 | 0.455 | -0.229 | 0.085 |
| 2.189690079552089 | 0.455 | -0.229 | 0.087 |
| 2.192831672205678 | 0.455 | -0.229 | 0.089 |
| 2.195973264859268 | 0.455 | -0.229 | 0.091 |
| 2.199114857512857 | 0.455 | -0.229 | 0.094 |
| 2.202256450166447 | 0.455 | -0.229 | 0.096 |
| 2.205398042820036 | 0.455 | -0.229 | 0.098 |
| 2.208539635473626 | 0.455 | -0.229 | 0.1 |
| 2.211681228127216 | 0.455 | -0.229 | 0.102 |
| 2.214822820780805 | 0.455 | -0.229 | 0.104 |
| 2.217964413434395 | 0.455 | -0.229 | 0.106 |
| 2.221106006087984 | 0.454 | -0.229 | 0.108 |
| 2.224247598741574 | 0.454 | -0.229 | 0.11 |
| 2.227389191395164 | 0.454 | -0.229 | 0.112 |
| 2.230530784048753 | 0.454 | -0.229 | 0.113 |
| 2.233672376702343 | 0.454 | -0.229 | 0.115 |
| 2.236813969355933 | 0.454 | -0.229 | 0.117 |
| 2.239955562009522 | 0.454 | -0.229 | 0.118 |
| 2.243097154663112 | 0.454 | -0.229 | 0.12 |
| 2.246238747316701 | 0.454 | -0.229 | 0.121 |
| 2.249380339970291 | 0.453 | -0.229 | 0.123 |
| 2.252521932623881 | 0.453 | -0.229 | 0.124 |
| 2.25566352527747 | 0.453 | -0.229 | 0.126 |
| 2.25880511793106 | 0.453 | -0.229 | 0.127 |
| 2.261946710584649 | 0.453 | -0.229 | 0.128 |
| 2.265088303238239 | 0.453 | -0.229 | 0.129 |
| 2.268229895891829 | 0.453 | -0.229 | 0.131 |
| 2.271371488545418 | 0.453 | -0.229 | 0.132 |
| 2.274513081199008 | 0.452 | -0.229 | 0.133 |
| 2.277654673852597 | 0.452 | -0.229 | 0.134 |
| 2.280796266506186 | 0.452 | -0.229 | 0.135 |
| 2.283937859159776 | 0.452 | -0.229 | 0.136 |
| 2.287079451813366 | 0.452 | -0.229 | 0.137 |
| 2.290221044466955 | 0.452 | -0.229 | 0.138 |
| 2.293362637120545 | 0.451 | -0.229 | 0.139 |
| 2.296504229774135 | 0.451 | -0.229 | 0.139 |
| 2.299645822427724 | 0.451 | -0.229 | 0.14 |
| 2.302787415081314 | 0.451 | -0.229 | 0.141 |
| 2.305929007734904 | 0.451 | -0.229 | 0.142 |
| 2.309070600388493 | 0.451 | -0.229 | 0.142 |
| 2.312212193042083 | 0.45 | -0.229 | 0.143 |
| 2.315353785695672 | 0.45 | -0.229 | 0.144 |
| 2.318495378349262 | 0.45 | -0.229 | 0.144 |
| 2.321636971002852 | 0.45 | -0.229 | 0.145 |
| 2.324778563656441 | 0.449 | -0.229 | 0.145 |
| 2.327920156310031 | 0.449 | -0.229 | 0.146 |
| 2.33106174896362 | 0.449 | -0.229 | 0.146 |
| 2.33420334161721 | 0.449 | -0.229 | 0.147 |
| 2.3373449342708 | 0.449 | -0.229 | 0.147 |
| 2.340486526924389 | 0.448 | -0.229 | 0.147 |
| 2.343628119577979 | 0.448 | -0.229 | 0.148 |
| 2.346769712231568 | 0.448 | -0.229 | 0.148 |
| 2.349911304885158 | 0.448 | -0.229 | 0.148 |
| 2.353052897538748 | 0.447 | -0.229 | 0.149 |
| 2.356194490192337 | 0.447 | -0.229 | 0.149 |
| 2.359336082845927 | 0.447 | -0.229 | 0.149 |
| 2.362477675499516 | 0.446 | -0.229 | 0.15 |
| 2.365619268153106 | 0.446 | -0.229 | 0.15 |
| 2.368760860806696 | 0.446 | -0.229 | 0.15 |
| 2.371902453460285 | 0.446 | -0.229 | 0.15 |
| 2.375044046113875 | 0.445 | -0.229 | 0.15 |
| 2.378185638767464 | 0.445 | -0.229 | 0.151 |
| 2.381327231421054 | 0.445 | -0.229 | 0.151 |
| 2.384468824074644 | 0.444 | -0.229 | 0.151 |
| 2.387610416728233 | 0.444 | -0.229 | 0.151 |
| 2.390752009381823 | 0.444 | -0.229 | 0.151 |
| 2.393893602035412 | 0.443 | -0.229 | 0.151 |
| 2.397035194689002 | 0.443 | -0.229 | 0.151 |
| 2.400176787342591 | 0.442 | -0.229 | 0.151 |
| 2.403318379996181 | 0.442 | -0.229 | 0.152 |
| 2.406459972649771 | 0.442 | -0.229 | 0.152 |
| 2.40960156530336 | 0.441 | -0.229 | 0.152 |
| 2.41274315795695 | 0.441 | -0.229 | 0.152 |
| 2.41588475061054 | 0.441 | -0.229 | 0.152 |
| 2.419026343264129 | 0.44 | -0.229 | 0.152 |
| 2.422167935917719 | 0.44 | -0.229 | 0.152 |
| 2.425309528571308 | 0.439 | -0.229 | 0.152 |
| 2.428451121224898 | 0.439 | -0.229 | 0.152 |
| 2.431592713878488 | 0.438 | -0.229 | 0.152 |
| 2.434734306532077 | 0.438 | -0.229 | 0.152 |
| 2.437875899185667 | 0.437 | -0.229 | 0.152 |
| 2.441017491839256 | 0.437 | -0.229 | 0.152 |
| 2.444159084492846 | 0.436 | -0.229 | 0.152 |
| 2.447300677146435 | 0.436 | -0.229 | 0.152 |
| 2.450442269800025 | 0.435 | -0.229 | 0.152 |
| 2.453583862453615 | 0.435 | -0.229 | 0.152 |
| 2.456725455107204 | 0.434 | -0.229 | 0.152 |
| 2.459867047760794 | 0.434 | -0.229 | 0.152 |
| 2.463008640414384 | 0.433 | -0.229 | 0.152 |
| 2.466150233067973 | 0.433 | -0.229 | 0.152 |
| 2.469291825721563 | 0.432 | -0.229 | 0.152 |
| 2.472433418375152 | 0.432 | -0.229 | 0.152 |
| 2.475575011028742 | 0.431 | -0.229 | 0.152 |
| 2.478716603682332 | 0.431 | -0.229 | 0.152 |
| 2.481858196335921 | 0.43 | -0.229 | 0.152 |
| 2.48499978898951 | 0.429 | -0.229 | 0.152 |
| 2.4881413816431 | 0.429 | -0.229 | 0.152 |
| 2.49128297429669 | 0.428 | -0.229 | 0.152 |
| 2.49442456695028 | 0.427 | -0.229 | 0.152 |
| 2.497566159603869 | 0.427 | -0.229 | 0.152 |
| 2.500707752257458 | 0.426 | -0.229 | 0.152 |
| 2.503849344911048 | 0.425 | -0.229 | 0.152 |
| 2.506990937564638 | 0.425 | -0.229 | 0.152 |
| 2.510132530218228 | 0.424 | -0.229 | 0.152 |
| 2.513274122871817 | 0.423 | -0.229 | 0.152 |
| 2.516415715525407 | 0.423 | -0.229 | 0.152 |
| 2.519557308178996 | 0.422 | -0.229 | 0.152 |
| 2.522698900832586 | 0.421 | -0.229 | 0.152 |
| 2.525840493486176 | 0.42 | -0.229 | 0.152 |
| 2.528982086139765 | 0.42 | -0.229 | 0.152 |
| 2.532123678793355 | 0.419 | -0.229 | 0.152 |
| 2.535265271446944 | 0.418 | -0.229 | 0.152 |
| 2.538406864100534 | 0.417 | -0.229 | 0.152 |
| 2.541548456754124 | 0.416 | -0.229 | 0.152 |
| 2.544690049407713 | 0.416 | -0.229 | 0.152 |
| 2.547831642061302 | 0.415 | -0.229 | 0.152 |
| 2.550973234714892 | 0.414 | -0.229 | 0.152 |
| 2.554114827368482 | 0.413 | -0.229 | 0.152 |
| 2.557256420022072 | 0.412 | -0.229 | 0.152 |
| 2.560398012675661 | 0.411 | -0.229 | 0.152 |
| 2.563539605329251 | 0.41 | -0.229 | 0.152 |
| 2.56668119798284 | 0.409 | -0.229 | 0.152 |
| 2.56982279063643 | 0.409 | -0.229 | 0.152 |
| 2.57296438329002 | 0.408 | -0.229 | 0.152 |
| 2.576105975943609 | 0.407 | -0.228 | 0.152 |
| 2.579247568597199 | 0.406 | -0.228 | 0.152 |
| 2.582389161250788 | 0.405 | -0.228 | 0.152 |
| 2.585530753904377 | 0.404 | -0.228 | 0.152 |
| 2.588672346557967 | 0.403 | -0.228 | 0.152 |
| 2.591813939211557 | 0.402 | -0.228 | 0.152 |
| 2.594955531865147 | 0.401 | -0.228 | 0.152 |
| 2.598097124518736 | 0.4 | -0.228 | 0.152 |
| 2.601238717172326 | 0.399 | -0.228 | 0.152 |
| 2.604380309825915 | 0.397 | -0.228 | 0.152 |
| 2.607521902479505 | 0.396 | -0.228 | 0.152 |
| 2.610663495133095 | 0.395 | -0.228 | 0.152 |
| 2.613805087786684 | 0.394 | -0.228 | 0.152 |
| 2.616946680440274 | 0.393 | -0.228 | 0.152 |
| 2.620088273093863 | 0.392 | -0.228 | 0.152 |
| 2.623229865747452 | 0.391 | -0.228 | 0.152 |
| 2.626371458401042 | 0.39 | -0.228 | 0.152 |
| 2.629513051054632 | 0.388 | -0.228 | 0.152 |
| 2.632654643708222 | 0.387 | -0.228 | 0.152 |
| 2.635796236361811 | 0.386 | -0.228 | 0.152 |
| 2.638937829015401 | 0.385 | -0.228 | 0.152 |
| 2.642079421668991 | 0.383 | -0.228 | 0.152 |
| 2.64522101432258 | 0.382 | -0.228 | 0.152 |
| 2.64836260697617 | 0.381 | -0.228 | 0.152 |
| 2.651504199629759 | 0.38 | -0.228 | 0.152 |
| 2.654645792283349 | 0.378 | -0.228 | 0.152 |
| 2.657787384936938 | 0.377 | -0.228 | 0.152 |
| 2.660928977590528 | 0.376 | -0.228 | 0.152 |
| 2.664070570244118 | 0.374 | -0.228 | 0.152 |
| 2.667212162897707 | 0.373 | -0.228 | 0.152 |
| 2.670353755551297 | 0.371 | -0.228 | 0.152 |
| 2.673495348204887 | 0.37 | -0.227 | 0.152 |
| 2.676636940858476 | 0.369 | -0.227 | 0.152 |
| 2.679778533512066 | 0.367 | -0.227 | 0.152 |
| 2.682920126165655 | 0.366 | -0.227 | 0.152 |
| 2.686061718819245 | 0.364 | -0.227 | 0.152 |
| 2.689203311472835 | 0.363 | -0.227 | 0.152 |
| 2.692344904126424 | 0.361 | -0.227 | 0.152 |
| 2.695486496780014 | 0.36 | -0.227 | 0.152 |
| 2.698628089433603 | 0.358 | -0.227 | 0.152 |
| 2.701769682087193 | 0.357 | -0.226 | 0.152 |
| 2.704911274740782 | 0.355 | -0.226 | 0.152 |
| 2.708052867394372 | 0.353 | -0.226 | 0.152 |
| 2.711194460047962 | 0.352 | -0.226 | 0.152 |
| 2.714336052701551 | 0.35 | -0.226 | 0.152 |
| 2.717477645355141 | 0.349 | -0.226 | 0.152 |
| 2.720619238008731 | 0.347 | -0.226 | 0.152 |
| 2.72376083066232 | 0.345 | -0.225 | 0.152 |
| 2.72690242331591 | 0.344 | -0.225 | 0.152 |
| 2.730044015969499 | 0.342 | -0.225 | 0.152 |
| 2.733185608623089 | 0.34 | -0.225 | 0.152 |
| 2.736327201276678 | 0.338 | -0.225 | 0.152 |
| 2.739468793930268 | 0.337 | -0.224 | 0.152 |
| 2.742610386583858 | 0.335 | -0.224 | 0.152 |
| 2.745751979237447 | 0.333 | -0.224 | 0.152 |
| 2.748893571891036 | 0.331 | -0.223 | 0.152 |
| 2.752035164544627 | 0.33 | -0.223 | 0.152 |
| 2.755176757198216 | 0.328 | -0.223 | 0.152 |
| 2.758318349851806 | 0.326 | -0.223 | 0.152 |
| 2.761459942505395 | 0.324 | -0.222 | 0.152 |
| 2.764601535158985 | 0.322 | -0.222 | 0.152 |
| 2.767743127812574 | 0.32 | -0.222 | 0.152 |
| 2.770884720466164 | 0.318 | -0.221 | 0.152 |
| 2.774026313119754 | 0.316 | -0.221 | 0.152 |
| 2.777167905773343 | 0.314 | -0.22 | 0.152 |
| 2.780309498426932 | 0.313 | -0.22 | 0.152 |
| 2.783451091080522 | 0.311 | -0.22 | 0.152 |
| 2.786592683734112 | 0.309 | -0.219 | 0.152 |
| 2.789734276387701 | 0.307 | -0.219 | 0.152 |
| 2.792875869041291 | 0.305 | -0.218 | 0.152 |
| 2.796017461694881 | 0.302 | -0.218 | 0.152 |
| 2.79915905434847 | 0.3 | -0.217 | 0.152 |
| 2.80230064700206 | 0.298 | -0.217 | 0.152 |
| 2.80544223965565 | 0.296 | -0.216 | 0.152 |
| 2.808583832309239 | 0.294 | -0.216 | 0.152 |
| 2.811725424962829 | 0.292 | -0.215 | 0.152 |
| 2.814867017616419 | 0.29 | -0.214 | 0.152 |
| 2.818008610270008 | 0.288 | -0.214 | 0.152 |
| 2.821150202923598 | 0.286 | -0.213 | 0.152 |
| 2.824291795577187 | 0.283 | -0.212 | 0.152 |
| 2.827433388230777 | 0.281 | -0.212 | 0.152 |
| 2.830574980884366 | 0.279 | -0.211 | 0.152 |
| 2.833716573537956 | 0.277 | -0.21 | 0.152 |
| 2.836858166191546 | 0.274 | -0.209 | 0.151 |
| 2.839999758845135 | 0.272 | -0.209 | 0.151 |
| 2.843141351498725 | 0.27 | -0.208 | 0.151 |
| 2.846282944152314 | 0.268 | -0.207 | 0.151 |
| 2.849424536805904 | 0.265 | -0.206 | 0.151 |
| 2.852566129459494 | 0.263 | -0.205 | 0.151 |
| 2.855707722113083 | 0.261 | -0.204 | 0.151 |
| 2.858849314766673 | 0.258 | -0.203 | 0.15 |
| 2.861990907420262 | 0.256 | -0.202 | 0.15 |
| 2.865132500073852 | 0.254 | -0.201 | 0.15 |
| 2.868274092727442 | 0.251 | -0.2 | 0.15 |
| 2.871415685381031 | 0.249 | -0.199 | 0.15 |
| 2.874557278034621 | 0.246 | -0.198 | 0.149 |
| 2.87769887068821 | 0.244 | -0.197 | 0.149 |
| 2.8808404633418 | 0.241 | -0.196 | 0.149 |
| 2.88398205599539 | 0.239 | -0.195 | 0.149 |
| 2.88712364864898 | 0.236 | -0.194 | 0.148 |
| 2.890265241302569 | 0.234 | -0.192 | 0.148 |
| 2.893406833956158 | 0.231 | -0.191 | 0.148 |
| 2.896548426609748 | 0.229 | -0.19 | 0.147 |
| 2.899690019263338 | 0.226 | -0.188 | 0.147 |
| 2.902831611916927 | 0.224 | -0.187 | 0.146 |
| 2.905973204570517 | 0.221 | -0.186 | 0.146 |
| 2.909114797224106 | 0.219 | -0.184 | 0.145 |
| 2.912256389877696 | 0.216 | -0.183 | 0.145 |
| 2.915397982531286 | 0.213 | -0.181 | 0.144 |
| 2.918539575184875 | 0.211 | -0.18 | 0.144 |
| 2.921681167838465 | 0.208 | -0.178 | 0.143 |
| 2.924822760492054 | 0.205 | -0.177 | 0.143 |
| 2.927964353145644 | 0.203 | -0.175 | 0.142 |
| 2.931105945799234 | 0.2 | -0.173 | 0.141 |
| 2.934247538452823 | 0.197 | -0.172 | 0.141 |
| 2.937389131106413 | 0.195 | -0.17 | 0.14 |
| 2.940530723760002 | 0.192 | -0.168 | 0.139 |
| 2.943672316413592 | 0.189 | -0.167 | 0.138 |
| 2.946813909067182 | 0.186 | -0.165 | 0.137 |
| 2.949955501720771 | 0.184 | -0.163 | 0.136 |
| 2.953097094374361 | 0.181 | -0.161 | 0.136 |
| 2.95623868702795 | 0.178 | -0.159 | 0.135 |
| 2.95938027968154 | 0.175 | -0.157 | 0.134 |
| 2.96252187233513 | 0.173 | -0.155 | 0.132 |
| 2.965663464988719 | 0.17 | -0.153 | 0.131 |
| 2.968805057642309 | 0.167 | -0.151 | 0.13 |
| 2.971946650295898 | 0.164 | -0.149 | 0.129 |
| 2.975088242949488 | 0.161 | -0.147 | 0.128 |
| 2.978229835603078 | 0.158 | -0.145 | 0.127 |
| 2.981371428256667 | 0.156 | -0.143 | 0.125 |
| 2.984513020910257 | 0.153 | -0.141 | 0.124 |
| 2.987654613563846 | 0.15 | -0.138 | 0.122 |
| 2.990796206217436 | 0.147 | -0.136 | 0.121 |
| 2.993937798871025 | 0.144 | -0.134 | 0.119 |
| 2.997079391524615 | 0.141 | -0.131 | 0.118 |
| 3.000220984178205 | 0.138 | -0.129 | 0.116 |
| 3.003362576831794 | 0.135 | -0.127 | 0.115 |
| 3.006504169485384 | 0.132 | -0.124 | 0.113 |
| 3.009645762138974 | 0.129 | -0.122 | 0.111 |
| 3.012787354792563 | 0.126 | -0.119 | 0.109 |
| 3.015928947446153 | 0.123 | -0.117 | 0.107 |
| 3.019070540099742 | 0.12 | -0.114 | 0.105 |
| 3.022212132753332 | 0.117 | -0.112 | 0.104 |
| 3.025353725406922 | 0.114 | -0.109 | 0.102 |
| 3.028495318060511 | 0.111 | -0.107 | 0.099 |
| 3.031636910714101 | 0.108 | -0.104 | 0.097 |
| 3.03477850336769 | 0.105 | -0.101 | 0.095 |
| 3.03792009602128 | 0.102 | -0.099 | 0.093 |
| 3.04106168867487 | 0.099 | -0.096 | 0.091 |
| 3.04420328132846 | 0.096 | -0.093 | 0.088 |
| 3.047344873982049 | 0.093 | -0.09 | 0.086 |
| 3.050486466635638 | 0.09 | -0.088 | 0.084 |
| 3.053628059289228 | 0.087 | -0.085 | 0.081 |
| 3.056769651942818 | 0.084 | -0.082 | 0.079 |
| 3.059911244596407 | 0.081 | -0.079 | 0.076 |
| 3.063052837249997 | 0.078 | -0.076 | 0.074 |
| 3.066194429903586 | 0.075 | -0.073 | 0.071 |
| 3.069336022557176 | 0.072 | -0.071 | 0.068 |
| 3.072477615210766 | 0.069 | -0.068 | 0.066 |
| 3.075619207864355 | 0.066 | -0.065 | 0.063 |
| 3.078760800517945 | 0.063 | -0.062 | 0.06 |
| 3.081902393171534 | 0.059 | -0.059 | 0.058 |
| 3.085043985825124 | 0.056 | -0.056 | 0.055 |
| 3.088185578478713 | 0.053 | -0.053 | 0.052 |
| 3.091327171132303 | 0.05 | -0.05 | 0.049 |
| 3.094468763785893 | 0.047 | -0.047 | 0.046 |
| 3.097610356439482 | 0.044 | -0.044 | 0.043 |
| 3.100751949093072 | 0.041 | -0.041 | 0.04 |
| 3.103893541746661 | 0.038 | -0.037 | 0.037 |
| 3.107035134400251 | 0.035 | -0.034 | 0.034 |
| 3.110176727053841 | 0.031 | -0.031 | 0.031 |
| 3.11331831970743 | 0.028 | -0.028 | 0.028 |
| 3.11645991236102 | 0.025 | -0.025 | 0.025 |
| 3.11960150501461 | 0.022 | -0.022 | 0.022 |
| 3.122743097668199 | 0.019 | -0.019 | 0.019 |
| 3.125884690321789 | 0.016 | -0.016 | 0.016 |
| 3.129026282975378 | 0.013 | -0.013 | 0.013 |
| 3.132167875628968 | 0.009 | -0.009 | 0.009 |
| 3.135309468282557 | 0.006 | -0.006 | 0.006 |
| 3.138451060936147 | 0.003 | -0.003 | 0.003 |
| 3.141592653589737 | 0 | 0 | 0 |
| 3.144734246243326 | -0.003 | 0.003 | -0.003 |
| 3.147875838896916 | -0.006 | 0.006 | -0.006 |
| 3.151017431550505 | -0.009 | 0.009 | -0.009 |
| 3.154159024204095 | -0.013 | 0.013 | -0.013 |
| 3.157300616857685 | -0.016 | 0.016 | -0.016 |
| 3.160442209511274 | -0.019 | 0.019 | -0.019 |
| 3.163583802164864 | -0.022 | 0.022 | -0.022 |
| 3.166725394818453 | -0.025 | 0.025 | -0.025 |
| 3.169866987472043 | -0.028 | 0.028 | -0.028 |
| 3.173008580125633 | -0.031 | 0.031 | -0.031 |
| 3.176150172779222 | -0.035 | 0.034 | -0.034 |
| 3.179291765432812 | -0.038 | 0.037 | -0.037 |
| 3.182433358086401 | -0.041 | 0.041 | -0.04 |
| 3.185574950739991 | -0.044 | 0.044 | -0.043 |
| 3.188716543393581 | -0.047 | 0.047 | -0.046 |
| 3.19185813604717 | -0.05 | 0.05 | -0.049 |
| 3.19499972870076 | -0.053 | 0.053 | -0.052 |
| 3.198141321354349 | -0.056 | 0.056 | -0.055 |
| 3.20128291400794 | -0.059 | 0.059 | -0.058 |
| 3.204424506661528 | -0.063 | 0.062 | -0.06 |
| 3.207566099315118 | -0.066 | 0.065 | -0.063 |
| 3.210707691968708 | -0.069 | 0.068 | -0.066 |
| 3.213849284622297 | -0.072 | 0.071 | -0.068 |
| 3.216990877275887 | -0.075 | 0.073 | -0.071 |
| 3.220132469929476 | -0.078 | 0.076 | -0.074 |
| 3.223274062583066 | -0.081 | 0.079 | -0.076 |
| 3.226415655236656 | -0.084 | 0.082 | -0.079 |
| 3.229557247890245 | -0.087 | 0.085 | -0.081 |
| 3.232698840543835 | -0.09 | 0.088 | -0.084 |
| 3.235840433197425 | -0.093 | 0.09 | -0.086 |
| 3.238982025851014 | -0.096 | 0.093 | -0.088 |
| 3.242123618504604 | -0.099 | 0.096 | -0.091 |
| 3.245265211158193 | -0.102 | 0.099 | -0.093 |
| 3.248406803811783 | -0.105 | 0.101 | -0.095 |
| 3.251548396465373 | -0.108 | 0.104 | -0.097 |
| 3.254689989118962 | -0.111 | 0.107 | -0.099 |
| 3.257831581772551 | -0.114 | 0.109 | -0.102 |
| 3.260973174426141 | -0.117 | 0.112 | -0.104 |
| 3.26411476707973 | -0.12 | 0.114 | -0.105 |
| 3.267256359733321 | -0.123 | 0.117 | -0.107 |
| 3.27039795238691 | -0.126 | 0.119 | -0.109 |
| 3.2735395450405 | -0.129 | 0.122 | -0.111 |
| 3.276681137694089 | -0.132 | 0.124 | -0.113 |
| 3.279822730347679 | -0.135 | 0.127 | -0.115 |
| 3.282964323001269 | -0.138 | 0.129 | -0.116 |
| 3.286105915654858 | -0.141 | 0.131 | -0.118 |
| 3.289247508308448 | -0.144 | 0.134 | -0.119 |
| 3.292389100962037 | -0.147 | 0.136 | -0.121 |
| 3.295530693615627 | -0.15 | 0.138 | -0.122 |
| 3.298672286269217 | -0.153 | 0.141 | -0.124 |
| 3.301813878922806 | -0.156 | 0.143 | -0.125 |
| 3.304955471576396 | -0.158 | 0.145 | -0.127 |
| 3.308097064229985 | -0.161 | 0.147 | -0.128 |
| 3.311238656883575 | -0.164 | 0.149 | -0.129 |
| 3.314380249537165 | -0.167 | 0.151 | -0.13 |
| 3.317521842190754 | -0.17 | 0.153 | -0.131 |
| 3.320663434844344 | -0.173 | 0.155 | -0.132 |
| 3.323805027497933 | -0.175 | 0.157 | -0.134 |
| 3.326946620151523 | -0.178 | 0.159 | -0.135 |
| 3.330088212805113 | -0.181 | 0.161 | -0.136 |
| 3.333229805458702 | -0.184 | 0.163 | -0.136 |
| 3.336371398112292 | -0.186 | 0.165 | -0.137 |
| 3.339512990765881 | -0.189 | 0.167 | -0.138 |
| 3.342654583419471 | -0.192 | 0.168 | -0.139 |
| 3.345796176073061 | -0.195 | 0.17 | -0.14 |
| 3.34893776872665 | -0.197 | 0.172 | -0.141 |
| 3.35207936138024 | -0.2 | 0.173 | -0.141 |
| 3.355220954033829 | -0.203 | 0.175 | -0.142 |
| 3.358362546687419 | -0.205 | 0.177 | -0.143 |
| 3.361504139341009 | -0.208 | 0.178 | -0.143 |
| 3.364645731994598 | -0.211 | 0.18 | -0.144 |
| 3.367787324648188 | -0.213 | 0.181 | -0.144 |
| 3.370928917301777 | -0.216 | 0.183 | -0.145 |
| 3.374070509955367 | -0.219 | 0.184 | -0.145 |
| 3.377212102608956 | -0.221 | 0.186 | -0.146 |
| 3.380353695262546 | -0.224 | 0.187 | -0.146 |
| 3.383495287916136 | -0.226 | 0.188 | -0.147 |
| 3.386636880569725 | -0.229 | 0.19 | -0.147 |
| 3.389778473223315 | -0.231 | 0.191 | -0.148 |
| 3.392920065876904 | -0.234 | 0.192 | -0.148 |
| 3.396061658530494 | -0.236 | 0.194 | -0.148 |
| 3.399203251184084 | -0.239 | 0.195 | -0.149 |
| 3.402344843837673 | -0.241 | 0.196 | -0.149 |
| 3.405486436491263 | -0.244 | 0.197 | -0.149 |
| 3.408628029144852 | -0.246 | 0.198 | -0.149 |
| 3.411769621798442 | -0.249 | 0.199 | -0.15 |
| 3.414911214452032 | -0.251 | 0.2 | -0.15 |
| 3.418052807105621 | -0.254 | 0.201 | -0.15 |
| 3.421194399759211 | -0.256 | 0.202 | -0.15 |
| 3.4243359924128 | -0.258 | 0.203 | -0.15 |
| 3.42747758506639 | -0.261 | 0.204 | -0.151 |
| 3.43061917771998 | -0.263 | 0.205 | -0.151 |
| 3.433760770373569 | -0.265 | 0.206 | -0.151 |
| 3.436902363027159 | -0.268 | 0.207 | -0.151 |
| 3.440043955680748 | -0.27 | 0.208 | -0.151 |
| 3.443185548334338 | -0.272 | 0.209 | -0.151 |
| 3.446327140987927 | -0.274 | 0.209 | -0.151 |
| 3.449468733641517 | -0.277 | 0.21 | -0.152 |
| 3.452610326295107 | -0.279 | 0.211 | -0.152 |
| 3.455751918948696 | -0.281 | 0.212 | -0.152 |
| 3.458893511602286 | -0.283 | 0.212 | -0.152 |
| 3.462035104255876 | -0.286 | 0.213 | -0.152 |
| 3.465176696909465 | -0.288 | 0.214 | -0.152 |
| 3.468318289563055 | -0.29 | 0.214 | -0.152 |
| 3.471459882216644 | -0.292 | 0.215 | -0.152 |
| 3.474601474870234 | -0.294 | 0.216 | -0.152 |
| 3.477743067523824 | -0.296 | 0.216 | -0.152 |
| 3.480884660177413 | -0.298 | 0.217 | -0.152 |
| 3.484026252831002 | -0.3 | 0.217 | -0.152 |
| 3.487167845484592 | -0.302 | 0.218 | -0.152 |
| 3.490309438138182 | -0.305 | 0.218 | -0.152 |
| 3.493451030791772 | -0.307 | 0.219 | -0.152 |
| 3.496592623445361 | -0.309 | 0.219 | -0.152 |
| 3.499734216098951 | -0.311 | 0.22 | -0.152 |
| 3.50287580875254 | -0.313 | 0.22 | -0.152 |
| 3.50601740140613 | -0.314 | 0.22 | -0.152 |
| 3.50915899405972 | -0.316 | 0.221 | -0.152 |
| 3.512300586713309 | -0.318 | 0.221 | -0.152 |
| 3.515442179366899 | -0.32 | 0.222 | -0.152 |
| 3.518583772020488 | -0.322 | 0.222 | -0.152 |
| 3.521725364674078 | -0.324 | 0.222 | -0.152 |
| 3.524866957327668 | -0.326 | 0.223 | -0.152 |
| 3.528008549981257 | -0.328 | 0.223 | -0.152 |
| 3.531150142634847 | -0.33 | 0.223 | -0.152 |
| 3.534291735288436 | -0.331 | 0.223 | -0.152 |
| 3.537433327942026 | -0.333 | 0.224 | -0.152 |
| 3.540574920595616 | -0.335 | 0.224 | -0.152 |
| 3.543716513249205 | -0.337 | 0.224 | -0.152 |
| 3.546858105902795 | -0.338 | 0.225 | -0.152 |
| 3.549999698556384 | -0.34 | 0.225 | -0.152 |
| 3.553141291209974 | -0.342 | 0.225 | -0.152 |
| 3.556282883863564 | -0.344 | 0.225 | -0.152 |
| 3.559424476517153 | -0.345 | 0.225 | -0.152 |
| 3.562566069170743 | -0.347 | 0.226 | -0.152 |
| 3.565707661824332 | -0.349 | 0.226 | -0.152 |
| 3.568849254477922 | -0.35 | 0.226 | -0.152 |
| 3.571990847131511 | -0.352 | 0.226 | -0.152 |
| 3.575132439785101 | -0.353 | 0.226 | -0.152 |
| 3.578274032438691 | -0.355 | 0.226 | -0.152 |
| 3.58141562509228 | -0.357 | 0.226 | -0.152 |
| 3.58455721774587 | -0.358 | 0.227 | -0.152 |
| 3.58769881039946 | -0.36 | 0.227 | -0.152 |
| 3.590840403053049 | -0.361 | 0.227 | -0.152 |
| 3.593981995706639 | -0.363 | 0.227 | -0.152 |
| 3.597123588360228 | -0.364 | 0.227 | -0.152 |
| 3.600265181013818 | -0.366 | 0.227 | -0.152 |
| 3.603406773667407 | -0.367 | 0.227 | -0.152 |
| 3.606548366320997 | -0.369 | 0.227 | -0.152 |
| 3.609689958974587 | -0.37 | 0.227 | -0.152 |
| 3.612831551628176 | -0.371 | 0.228 | -0.152 |
| 3.615973144281766 | -0.373 | 0.228 | -0.152 |
| 3.619114736935355 | -0.374 | 0.228 | -0.152 |
| 3.622256329588945 | -0.376 | 0.228 | -0.152 |
| 3.625397922242534 | -0.377 | 0.228 | -0.152 |
| 3.628539514896124 | -0.378 | 0.228 | -0.152 |
| 3.631681107549714 | -0.38 | 0.228 | -0.152 |
| 3.634822700203303 | -0.381 | 0.228 | -0.152 |
| 3.637964292856893 | -0.382 | 0.228 | -0.152 |
| 3.641105885510483 | -0.383 | 0.228 | -0.152 |
| 3.644247478164072 | -0.385 | 0.228 | -0.152 |
| 3.647389070817662 | -0.386 | 0.228 | -0.152 |
| 3.650530663471251 | -0.387 | 0.228 | -0.152 |
| 3.653672256124841 | -0.388 | 0.228 | -0.152 |
| 3.656813848778431 | -0.39 | 0.228 | -0.152 |
| 3.65995544143202 | -0.391 | 0.228 | -0.152 |
| 3.66309703408561 | -0.392 | 0.228 | -0.152 |
| 3.666238626739199 | -0.393 | 0.228 | -0.152 |
| 3.66938021939279 | -0.394 | 0.228 | -0.152 |
| 3.672521812046378 | -0.395 | 0.228 | -0.152 |
| 3.675663404699968 | -0.396 | 0.228 | -0.152 |
| 3.678804997353558 | -0.397 | 0.228 | -0.152 |
| 3.681946590007147 | -0.399 | 0.228 | -0.152 |
| 3.685088182660737 | -0.4 | 0.228 | -0.152 |
| 3.688229775314326 | -0.401 | 0.228 | -0.152 |
| 3.691371367967916 | -0.402 | 0.228 | -0.152 |
| 3.694512960621506 | -0.403 | 0.228 | -0.152 |
| 3.697654553275095 | -0.404 | 0.228 | -0.152 |
| 3.700796145928685 | -0.405 | 0.228 | -0.152 |
| 3.703937738582274 | -0.406 | 0.228 | -0.152 |
| 3.707079331235864 | -0.407 | 0.228 | -0.152 |
| 3.710220923889454 | -0.408 | 0.229 | -0.152 |
| 3.713362516543043 | -0.409 | 0.229 | -0.152 |
| 3.716504109196633 | -0.409 | 0.229 | -0.152 |
| 3.719645701850223 | -0.41 | 0.229 | -0.152 |
| 3.722787294503812 | -0.411 | 0.229 | -0.152 |
| 3.725928887157402 | -0.412 | 0.229 | -0.152 |
| 3.729070479810991 | -0.413 | 0.229 | -0.152 |
| 3.732212072464581 | -0.414 | 0.229 | -0.152 |
| 3.735353665118171 | -0.415 | 0.229 | -0.152 |
| 3.73849525777176 | -0.416 | 0.229 | -0.152 |
| 3.74163685042535 | -0.416 | 0.229 | -0.152 |
| 3.744778443078939 | -0.417 | 0.229 | -0.152 |
| 3.747920035732529 | -0.418 | 0.229 | -0.152 |
| 3.751061628386119 | -0.419 | 0.229 | -0.152 |
| 3.754203221039708 | -0.42 | 0.229 | -0.152 |
| 3.757344813693298 | -0.42 | 0.229 | -0.152 |
| 3.760486406346887 | -0.421 | 0.229 | -0.152 |
| 3.763627999000477 | -0.422 | 0.229 | -0.152 |
| 3.766769591654067 | -0.423 | 0.229 | -0.152 |
| 3.769911184307656 | -0.423 | 0.229 | -0.152 |
| 3.773052776961246 | -0.424 | 0.229 | -0.152 |
| 3.776194369614835 | -0.425 | 0.229 | -0.152 |
| 3.779335962268425 | -0.425 | 0.229 | -0.152 |
| 3.782477554922014 | -0.426 | 0.229 | -0.152 |
| 3.785619147575604 | -0.427 | 0.229 | -0.152 |
| 3.788760740229193 | -0.427 | 0.229 | -0.152 |
| 3.791902332882783 | -0.428 | 0.229 | -0.152 |
| 3.795043925536373 | -0.429 | 0.229 | -0.152 |
| 3.798185518189962 | -0.429 | 0.229 | -0.152 |
| 3.801327110843552 | -0.43 | 0.229 | -0.152 |
| 3.804468703497142 | -0.431 | 0.229 | -0.152 |
| 3.807610296150731 | -0.431 | 0.229 | -0.152 |
| 3.810751888804321 | -0.432 | 0.229 | -0.152 |
| 3.813893481457911 | -0.432 | 0.229 | -0.152 |
| 3.8170350741115 | -0.433 | 0.229 | -0.152 |
| 3.82017666676509 | -0.433 | 0.229 | -0.152 |
| 3.823318259418679 | -0.434 | 0.229 | -0.152 |
| 3.826459852072269 | -0.434 | 0.229 | -0.152 |
| 3.829601444725859 | -0.435 | 0.229 | -0.152 |
| 3.832743037379448 | -0.435 | 0.229 | -0.152 |
| 3.835884630033038 | -0.436 | 0.229 | -0.152 |
| 3.839026222686627 | -0.436 | 0.229 | -0.152 |
| 3.842167815340217 | -0.437 | 0.229 | -0.152 |
| 3.845309407993807 | -0.437 | 0.229 | -0.152 |
| 3.848451000647396 | -0.438 | 0.229 | -0.152 |
| 3.851592593300986 | -0.438 | 0.229 | -0.152 |
| 3.854734185954575 | -0.439 | 0.229 | -0.152 |
| 3.857875778608165 | -0.439 | 0.229 | -0.152 |
| 3.861017371261755 | -0.44 | 0.229 | -0.152 |
| 3.864158963915344 | -0.44 | 0.229 | -0.152 |
| 3.867300556568933 | -0.441 | 0.229 | -0.152 |
| 3.870442149222523 | -0.441 | 0.229 | -0.152 |
| 3.873583741876112 | -0.441 | 0.229 | -0.152 |
| 3.876725334529703 | -0.442 | 0.229 | -0.152 |
| 3.879866927183292 | -0.442 | 0.229 | -0.152 |
| 3.883008519836882 | -0.442 | 0.229 | -0.151 |
| 3.886150112490471 | -0.443 | 0.229 | -0.151 |
| 3.889291705144061 | -0.443 | 0.229 | -0.151 |
| 3.892433297797651 | -0.444 | 0.229 | -0.151 |
| 3.89557489045124 | -0.444 | 0.229 | -0.151 |
| 3.89871648310483 | -0.444 | 0.229 | -0.151 |
| 3.901858075758419 | -0.445 | 0.229 | -0.151 |
| 3.904999668412009 | -0.445 | 0.229 | -0.151 |
| 3.908141261065598 | -0.445 | 0.229 | -0.15 |
| 3.911282853719188 | -0.446 | 0.229 | -0.15 |
| 3.914424446372778 | -0.446 | 0.229 | -0.15 |
| 3.917566039026367 | -0.446 | 0.229 | -0.15 |
| 3.920707631679957 | -0.446 | 0.229 | -0.15 |
| 3.923849224333547 | -0.447 | 0.229 | -0.149 |
| 3.926990816987136 | -0.447 | 0.229 | -0.149 |
| 3.930132409640726 | -0.447 | 0.229 | -0.149 |
| 3.933274002294315 | -0.448 | 0.229 | -0.148 |
| 3.936415594947905 | -0.448 | 0.229 | -0.148 |
| 3.939557187601495 | -0.448 | 0.229 | -0.148 |
| 3.942698780255084 | -0.448 | 0.229 | -0.147 |
| 3.945840372908674 | -0.449 | 0.229 | -0.147 |
| 3.948981965562263 | -0.449 | 0.229 | -0.147 |
| 3.952123558215853 | -0.449 | 0.229 | -0.146 |
| 3.955265150869442 | -0.449 | 0.229 | -0.146 |
| 3.958406743523032 | -0.449 | 0.229 | -0.145 |
| 3.961548336176622 | -0.45 | 0.229 | -0.145 |
| 3.964689928830211 | -0.45 | 0.229 | -0.144 |
| 3.967831521483801 | -0.45 | 0.229 | -0.144 |
| 3.97097311413739 | -0.45 | 0.229 | -0.143 |
| 3.97411470679098 | -0.451 | 0.229 | -0.142 |
| 3.97725629944457 | -0.451 | 0.229 | -0.142 |
| 3.98039789209816 | -0.451 | 0.229 | -0.141 |
| 3.983539484751749 | -0.451 | 0.229 | -0.14 |
| 3.986681077405338 | -0.451 | 0.229 | -0.139 |
| 3.989822670058928 | -0.451 | 0.229 | -0.139 |
| 3.992964262712517 | -0.452 | 0.229 | -0.138 |
| 3.996105855366107 | -0.452 | 0.229 | -0.137 |
| 3.999247448019697 | -0.452 | 0.229 | -0.136 |
| 4.002389040673287 | -0.452 | 0.229 | -0.135 |
| 4.005530633326877 | -0.452 | 0.229 | -0.134 |
| 4.008672225980466 | -0.452 | 0.229 | -0.133 |
| 4.011813818634056 | -0.453 | 0.229 | -0.132 |
| 4.014955411287645 | -0.453 | 0.229 | -0.131 |
| 4.018097003941234 | -0.453 | 0.229 | -0.129 |
| 4.021238596594824 | -0.453 | 0.229 | -0.128 |
| 4.024380189248414 | -0.453 | 0.229 | -0.127 |
| 4.027521781902004 | -0.453 | 0.229 | -0.126 |
| 4.030663374555593 | -0.453 | 0.229 | -0.124 |
| 4.033804967209183 | -0.453 | 0.229 | -0.123 |
| 4.036946559862773 | -0.454 | 0.229 | -0.121 |
| 4.040088152516362 | -0.454 | 0.229 | -0.12 |
| 4.043229745169951 | -0.454 | 0.229 | -0.118 |
| 4.046371337823541 | -0.454 | 0.229 | -0.117 |
| 4.049512930477131 | -0.454 | 0.229 | -0.115 |
| 4.05265452313072 | -0.454 | 0.229 | -0.113 |
| 4.05579611578431 | -0.454 | 0.229 | -0.112 |
| 4.0589377084379 | -0.454 | 0.229 | -0.11 |
| 4.062079301091489 | -0.454 | 0.229 | -0.108 |
| 4.065220893745079 | -0.455 | 0.229 | -0.106 |
| 4.068362486398668 | -0.455 | 0.229 | -0.104 |
| 4.071504079052258 | -0.455 | 0.229 | -0.102 |
| 4.074645671705848 | -0.455 | 0.229 | -0.1 |
| 4.077787264359437 | -0.455 | 0.229 | -0.098 |
| 4.080928857013027 | -0.455 | 0.229 | -0.096 |
| 4.084070449666616 | -0.455 | 0.229 | -0.094 |
| 4.087212042320206 | -0.455 | 0.229 | -0.091 |
| 4.090353634973795 | -0.455 | 0.229 | -0.089 |
| 4.093495227627385 | -0.455 | 0.229 | -0.087 |
| 4.096636820280975 | -0.455 | 0.229 | -0.085 |
| 4.099778412934564 | -0.455 | 0.229 | -0.082 |
| 4.102920005588154 | -0.455 | 0.229 | -0.08 |
| 4.106061598241744 | -0.456 | 0.229 | -0.077 |
| 4.109203190895333 | -0.456 | 0.229 | -0.075 |
| 4.112344783548923 | -0.456 | 0.229 | -0.072 |
| 4.115486376202512 | -0.456 | 0.229 | -0.069 |
| 4.118627968856102 | -0.456 | 0.229 | -0.067 |
| 4.121769561509692 | -0.456 | 0.229 | -0.064 |
| 4.124911154163281 | -0.456 | 0.229 | -0.061 |
| 4.128052746816871 | -0.456 | 0.229 | -0.058 |
| 4.13119433947046 | -0.456 | 0.229 | -0.056 |
| 4.13433593212405 | -0.456 | 0.229 | -0.053 |
| 4.13747752477764 | -0.456 | 0.229 | -0.05 |
| 4.14061911743123 | -0.456 | 0.229 | -0.047 |
| 4.143760710084818 | -0.456 | 0.229 | -0.044 |
| 4.146902302738408 | -0.456 | 0.228 | -0.041 |
| 4.150043895391998 | -0.456 | 0.228 | -0.038 |
| 4.153185488045588 | -0.456 | 0.228 | -0.035 |
| 4.156327080699177 | -0.456 | 0.228 | -0.032 |
| 4.159468673352766 | -0.456 | 0.228 | -0.029 |
| 4.162610266006356 | -0.456 | 0.228 | -0.026 |
| 4.165751858659946 | -0.456 | 0.228 | -0.023 |
| 4.168893451313535 | -0.456 | 0.228 | -0.02 |
| 4.172035043967125 | -0.456 | 0.228 | -0.017 |
| 4.175176636620715 | -0.456 | 0.228 | -0.014 |
| 4.178318229274304 | -0.457 | 0.228 | -0.01 |
| 4.181459821927894 | -0.457 | 0.228 | -0.007 |
| 4.184601414581484 | -0.457 | 0.228 | -0.004 |
| 4.187743007235073 | -0.457 | 0.228 | -0.001 |
| 4.190884599888663 | -0.457 | 0.228 | 0.002 |
| 4.194026192542252 | -0.457 | 0.228 | 0.005 |
| 4.197167785195842 | -0.457 | 0.228 | 0.008 |
| 4.200309377849432 | -0.457 | 0.228 | 0.012 |
| 4.203450970503021 | -0.457 | 0.228 | 0.015 |
| 4.206592563156611 | -0.457 | 0.228 | 0.018 |
| 4.2097341558102 | -0.457 | 0.228 | 0.021 |
| 4.21287574846379 | -0.457 | 0.228 | 0.024 |
| 4.21601734111738 | -0.457 | 0.228 | 0.027 |
| 4.21915893377097 | -0.457 | 0.228 | 0.03 |
| 4.222300526424559 | -0.457 | 0.228 | 0.033 |
| 4.225442119078148 | -0.457 | 0.228 | 0.036 |
| 4.228583711731738 | -0.457 | 0.228 | 0.039 |
| 4.231725304385327 | -0.457 | 0.228 | 0.042 |
| 4.234866897038917 | -0.457 | 0.228 | 0.045 |
| 4.238008489692506 | -0.457 | 0.228 | 0.048 |
| 4.241150082346096 | -0.457 | 0.228 | 0.051 |
| 4.244291674999685 | -0.457 | 0.227 | 0.054 |
| 4.247433267653276 | -0.457 | 0.227 | 0.057 |
| 4.250574860306865 | -0.457 | 0.227 | 0.059 |
| 4.253716452960455 | -0.457 | 0.227 | 0.062 |
| 4.256858045614044 | -0.457 | 0.227 | 0.065 |
| 4.259999638267634 | -0.457 | 0.227 | 0.068 |
| 4.263141230921224 | -0.457 | 0.227 | 0.07 |
| 4.266282823574813 | -0.457 | 0.227 | 0.073 |
| 4.269424416228403 | -0.457 | 0.227 | 0.075 |
| 4.272566008881992 | -0.457 | 0.226 | 0.078 |
| 4.275707601535582 | -0.457 | 0.226 | 0.08 |
| 4.27884919418917 | -0.457 | 0.226 | 0.083 |
| 4.28199078684276 | -0.457 | 0.226 | 0.085 |
| 4.285132379496351 | -0.457 | 0.226 | 0.088 |
| 4.28827397214994 | -0.457 | 0.226 | 0.09 |
| 4.29141556480353 | -0.457 | 0.226 | 0.092 |
| 4.294557157457119 | -0.457 | 0.225 | 0.094 |
| 4.29769875011071 | -0.457 | 0.225 | 0.097 |
| 4.300840342764299 | -0.457 | 0.225 | 0.099 |
| 4.303981935417888 | -0.457 | 0.225 | 0.101 |
| 4.307123528071478 | -0.457 | 0.225 | 0.103 |
| 4.310265120725067 | -0.457 | 0.224 | 0.105 |
| 4.313406713378657 | -0.457 | 0.224 | 0.107 |
| 4.316548306032247 | -0.457 | 0.224 | 0.109 |
| 4.319689898685836 | -0.457 | 0.223 | 0.11 |
| 4.322831491339426 | -0.457 | 0.223 | 0.112 |
| 4.325973083993015 | -0.457 | 0.223 | 0.114 |
| 4.329114676646605 | -0.457 | 0.223 | 0.116 |
| 4.332256269300195 | -0.457 | 0.222 | 0.117 |
| 4.335397861953784 | -0.457 | 0.222 | 0.119 |
| 4.338539454607374 | -0.457 | 0.222 | 0.12 |
| 4.341681047260963 | -0.457 | 0.221 | 0.122 |
| 4.344822639914553 | -0.457 | 0.221 | 0.123 |
| 4.347964232568143 | -0.457 | 0.22 | 0.125 |
| 4.351105825221732 | -0.457 | 0.22 | 0.126 |
| 4.354247417875322 | -0.457 | 0.22 | 0.127 |
| 4.357389010528911 | -0.457 | 0.219 | 0.129 |
| 4.360530603182501 | -0.457 | 0.219 | 0.13 |
| 4.36367219583609 | -0.457 | 0.218 | 0.131 |
| 4.36681378848968 | -0.457 | 0.218 | 0.132 |
| 4.36995538114327 | -0.457 | 0.217 | 0.133 |
| 4.373096973796859 | -0.457 | 0.217 | 0.134 |
| 4.376238566450449 | -0.457 | 0.216 | 0.135 |
| 4.379380159104038 | -0.457 | 0.216 | 0.136 |
| 4.382521751757628 | -0.457 | 0.215 | 0.137 |
| 4.385663344411217 | -0.457 | 0.214 | 0.138 |
| 4.388804937064807 | -0.457 | 0.214 | 0.139 |
| 4.391946529718397 | -0.457 | 0.213 | 0.14 |
| 4.395088122371987 | -0.457 | 0.212 | 0.14 |
| 4.398229715025576 | -0.457 | 0.212 | 0.141 |
| 4.401371307679165 | -0.457 | 0.211 | 0.142 |
| 4.404512900332755 | -0.457 | 0.21 | 0.142 |
| 4.407654492986345 | -0.457 | 0.209 | 0.143 |
| 4.410796085639934 | -0.457 | 0.209 | 0.144 |
| 4.413937678293524 | -0.457 | 0.208 | 0.144 |
| 4.417079270947114 | -0.457 | 0.207 | 0.145 |
| 4.420220863600703 | -0.457 | 0.206 | 0.145 |
| 4.423362456254293 | -0.457 | 0.205 | 0.146 |
| 4.426504048907883 | -0.457 | 0.204 | 0.146 |
| 4.429645641561472 | -0.457 | 0.203 | 0.147 |
| 4.432787234215062 | -0.457 | 0.202 | 0.147 |
| 4.435928826868651 | -0.457 | 0.201 | 0.147 |
| 4.43907041952224 | -0.457 | 0.2 | 0.148 |
| 4.44221201217583 | -0.457 | 0.199 | 0.148 |
| 4.44535360482942 | -0.457 | 0.198 | 0.149 |
| 4.44849519748301 | -0.457 | 0.197 | 0.149 |
| 4.4516367901366 | -0.457 | 0.196 | 0.149 |
| 4.454778382790188 | -0.457 | 0.195 | 0.149 |
| 4.457919975443779 | -0.457 | 0.194 | 0.15 |
| 4.461061568097368 | -0.457 | 0.192 | 0.15 |
| 4.464203160750958 | -0.457 | 0.191 | 0.15 |
| 4.467344753404547 | -0.457 | 0.19 | 0.15 |
| 4.470486346058137 | -0.457 | 0.188 | 0.15 |
| 4.473627938711726 | -0.457 | 0.187 | 0.151 |
| 4.476769531365316 | -0.457 | 0.186 | 0.151 |
| 4.479911124018905 | -0.457 | 0.184 | 0.151 |
| 4.483052716672495 | -0.457 | 0.183 | 0.151 |
| 4.486194309326085 | -0.457 | 0.181 | 0.151 |
| 4.489335901979674 | -0.457 | 0.18 | 0.151 |
| 4.492477494633264 | -0.457 | 0.178 | 0.151 |
| 4.495619087286854 | -0.457 | 0.177 | 0.151 |
| 4.498760679940443 | -0.457 | 0.175 | 0.152 |
| 4.501902272594033 | -0.457 | 0.173 | 0.152 |
| 4.505043865247622 | -0.457 | 0.172 | 0.152 |
| 4.508185457901212 | -0.457 | 0.17 | 0.152 |
| 4.511327050554801 | -0.457 | 0.168 | 0.152 |
| 4.514468643208391 | -0.457 | 0.167 | 0.152 |
| 4.517610235861981 | -0.457 | 0.165 | 0.152 |
| 4.520751828515571 | -0.457 | 0.163 | 0.152 |
| 4.52389342116916 | -0.457 | 0.161 | 0.152 |
| 4.52703501382275 | -0.457 | 0.159 | 0.152 |
| 4.530176606476339 | -0.457 | 0.157 | 0.152 |
| 4.533318199129928 | -0.457 | 0.155 | 0.152 |
| 4.536459791783518 | -0.457 | 0.153 | 0.152 |
| 4.539601384437108 | -0.457 | 0.151 | 0.152 |
| 4.542742977090698 | -0.457 | 0.149 | 0.152 |
| 4.545884569744287 | -0.457 | 0.147 | 0.152 |
| 4.549026162397876 | -0.457 | 0.145 | 0.152 |
| 4.552167755051466 | -0.457 | 0.143 | 0.152 |
| 4.555309347705056 | -0.457 | 0.141 | 0.152 |
| 4.558450940358646 | -0.457 | 0.138 | 0.152 |
| 4.561592533012235 | -0.457 | 0.136 | 0.152 |
| 4.564734125665825 | -0.457 | 0.134 | 0.152 |
| 4.567875718319415 | -0.457 | 0.131 | 0.152 |
| 4.571017310973004 | -0.457 | 0.129 | 0.152 |
| 4.574158903626594 | -0.457 | 0.127 | 0.152 |
| 4.577300496280183 | -0.457 | 0.124 | 0.152 |
| 4.580442088933772 | -0.457 | 0.122 | 0.152 |
| 4.583583681587362 | -0.457 | 0.119 | 0.152 |
| 4.586725274240952 | -0.457 | 0.117 | 0.152 |
| 4.589866866894542 | -0.457 | 0.114 | 0.152 |
| 4.593008459548131 | -0.457 | 0.112 | 0.152 |
| 4.596150052201721 | -0.457 | 0.109 | 0.152 |
| 4.59929164485531 | -0.457 | 0.107 | 0.152 |
| 4.6024332375089 | -0.457 | 0.104 | 0.152 |
| 4.60557483016249 | -0.457 | 0.101 | 0.152 |
| 4.608716422816079 | -0.457 | 0.099 | 0.152 |
| 4.611858015469668 | -0.457 | 0.096 | 0.152 |
| 4.614999608123258 | -0.457 | 0.093 | 0.152 |
| 4.618141200776848 | -0.457 | 0.09 | 0.152 |
| 4.621282793430437 | -0.457 | 0.088 | 0.152 |
| 4.624424386084027 | -0.457 | 0.085 | 0.152 |
| 4.627565978737617 | -0.457 | 0.082 | 0.152 |
| 4.630707571391206 | -0.457 | 0.079 | 0.152 |
| 4.633849164044795 | -0.457 | 0.076 | 0.152 |
| 4.636990756698386 | -0.457 | 0.073 | 0.152 |
| 4.640132349351975 | -0.457 | 0.071 | 0.152 |
| 4.643273942005564 | -0.457 | 0.068 | 0.152 |
| 4.646415534659154 | -0.457 | 0.065 | 0.152 |
| 4.649557127312744 | -0.457 | 0.062 | 0.152 |
| 4.652698719966334 | -0.457 | 0.059 | 0.152 |
| 4.655840312619923 | -0.457 | 0.056 | 0.152 |
| 4.658981905273513 | -0.457 | 0.053 | 0.152 |
| 4.662123497927102 | -0.457 | 0.05 | 0.152 |
| 4.665265090580692 | -0.457 | 0.047 | 0.152 |
| 4.668406683234282 | -0.457 | 0.044 | 0.152 |
| 4.671548275887871 | -0.457 | 0.041 | 0.152 |
| 4.674689868541461 | -0.457 | 0.037 | 0.152 |
| 4.67783146119505 | -0.457 | 0.034 | 0.152 |
| 4.68097305384864 | -0.457 | 0.031 | 0.152 |
| 4.68411464650223 | -0.457 | 0.028 | 0.152 |
| 4.687256239155819 | -0.457 | 0.025 | 0.152 |
| 4.690397831809409 | -0.457 | 0.022 | 0.152 |
| 4.693539424462998 | -0.457 | 0.019 | 0.152 |
| 4.696681017116588 | -0.457 | 0.016 | 0.152 |
| 4.699822609770177 | -0.457 | 0.013 | 0.152 |
| 4.702964202423767 | -0.457 | 0.009 | 0.152 |
| 4.706105795077356 | -0.457 | 0.006 | 0.152 |
| 4.709247387730946 | -0.457 | 0.003 | 0.152 |
| 4.712388980384535 | -0.457 | 0 | 0.152 |
| 4.715530573038126 | -0.457 | -0.003 | 0.152 |
| 4.718672165691715 | -0.457 | -0.006 | 0.152 |
| 4.721813758345305 | -0.457 | -0.009 | 0.152 |
| 4.724955350998894 | -0.457 | -0.013 | 0.152 |
| 4.728096943652484 | -0.457 | -0.016 | 0.152 |
| 4.731238536306074 | -0.457 | -0.019 | 0.152 |
| 4.734380128959663 | -0.457 | -0.022 | 0.152 |
| 4.737521721613253 | -0.457 | -0.025 | 0.152 |
| 4.740663314266842 | -0.457 | -0.028 | 0.152 |
| 4.743804906920432 | -0.457 | -0.031 | 0.152 |
| 4.74694649957402 | -0.457 | -0.034 | 0.152 |
| 4.750088092227611 | -0.457 | -0.037 | 0.152 |
| 4.7532296848812 | -0.457 | -0.041 | 0.152 |
| 4.75637127753479 | -0.457 | -0.044 | 0.152 |
| 4.75951287018838 | -0.457 | -0.047 | 0.152 |
| 4.76265446284197 | -0.457 | -0.05 | 0.152 |
| 4.765796055495559 | -0.457 | -0.053 | 0.152 |
| 4.768937648149149 | -0.457 | -0.056 | 0.152 |
| 4.772079240802738 | -0.457 | -0.059 | 0.152 |
| 4.775220833456327 | -0.457 | -0.062 | 0.152 |
| 4.778362426109917 | -0.457 | -0.065 | 0.152 |
| 4.781504018763507 | -0.457 | -0.068 | 0.152 |
| 4.784645611417097 | -0.457 | -0.071 | 0.152 |
| 4.787787204070686 | -0.457 | -0.073 | 0.152 |
| 4.790928796724275 | -0.457 | -0.076 | 0.152 |
| 4.794070389377865 | -0.457 | -0.079 | 0.152 |
| 4.797211982031455 | -0.457 | -0.082 | 0.152 |
| 4.800353574685045 | -0.457 | -0.085 | 0.152 |
| 4.803495167338634 | -0.457 | -0.088 | 0.152 |
| 4.806636759992224 | -0.457 | -0.09 | 0.152 |
| 4.809778352645814 | -0.457 | -0.093 | 0.152 |
| 4.812919945299403 | -0.457 | -0.096 | 0.152 |
| 4.816061537952993 | -0.457 | -0.099 | 0.152 |
| 4.819203130606582 | -0.457 | -0.101 | 0.152 |
| 4.822344723260172 | -0.457 | -0.104 | 0.152 |
| 4.825486315913761 | -0.457 | -0.107 | 0.152 |
| 4.828627908567351 | -0.457 | -0.109 | 0.152 |
| 4.83176950122094 | -0.457 | -0.112 | 0.152 |
| 4.83491109387453 | -0.457 | -0.114 | 0.152 |
| 4.83805268652812 | -0.457 | -0.117 | 0.152 |
| 4.841194279181709 | -0.457 | -0.119 | 0.152 |
| 4.844335871835299 | -0.457 | -0.122 | 0.152 |
| 4.847477464488889 | -0.457 | -0.124 | 0.152 |
| 4.850619057142478 | -0.457 | -0.127 | 0.152 |
| 4.853760649796068 | -0.457 | -0.129 | 0.152 |
| 4.856902242449657 | -0.457 | -0.131 | 0.152 |
| 4.860043835103247 | -0.457 | -0.134 | 0.152 |
| 4.863185427756837 | -0.457 | -0.136 | 0.152 |
| 4.866327020410426 | -0.457 | -0.138 | 0.152 |
| 4.869468613064015 | -0.457 | -0.141 | 0.152 |
| 4.872610205717605 | -0.457 | -0.143 | 0.152 |
| 4.875751798371195 | -0.457 | -0.145 | 0.152 |
| 4.878893391024784 | -0.457 | -0.147 | 0.152 |
| 4.882034983678374 | -0.457 | -0.149 | 0.152 |
| 4.885176576331964 | -0.457 | -0.151 | 0.152 |
| 4.888318168985553 | -0.457 | -0.153 | 0.152 |
| 4.891459761639143 | -0.457 | -0.155 | 0.152 |
| 4.894601354292733 | -0.457 | -0.157 | 0.152 |
| 4.897742946946322 | -0.457 | -0.159 | 0.152 |
| 4.900884539599912 | -0.457 | -0.161 | 0.152 |
| 4.904026132253501 | -0.457 | -0.163 | 0.152 |
| 4.907167724907091 | -0.457 | -0.165 | 0.152 |
| 4.91030931756068 | -0.457 | -0.167 | 0.152 |
| 4.91345091021427 | -0.457 | -0.168 | 0.152 |
| 4.91659250286786 | -0.457 | -0.17 | 0.152 |
| 4.91973409552145 | -0.457 | -0.172 | 0.152 |
| 4.922875688175039 | -0.457 | -0.173 | 0.152 |
| 4.926017280828628 | -0.457 | -0.175 | 0.152 |
| 4.929158873482218 | -0.457 | -0.177 | 0.151 |
| 4.932300466135808 | -0.457 | -0.178 | 0.151 |
| 4.935442058789397 | -0.457 | -0.18 | 0.151 |
| 4.938583651442987 | -0.457 | -0.181 | 0.151 |
| 4.941725244096576 | -0.457 | -0.183 | 0.151 |
| 4.944866836750166 | -0.457 | -0.184 | 0.151 |
| 4.948008429403755 | -0.457 | -0.186 | 0.151 |
| 4.951150022057345 | -0.457 | -0.187 | 0.151 |
| 4.954291614710935 | -0.457 | -0.188 | 0.15 |
| 4.957433207364524 | -0.457 | -0.19 | 0.15 |
| 4.960574800018114 | -0.457 | -0.191 | 0.15 |
| 4.963716392671704 | -0.457 | -0.192 | 0.15 |
| 4.966857985325293 | -0.457 | -0.194 | 0.15 |
| 4.969999577978883 | -0.457 | -0.195 | 0.149 |
| 4.973141170632472 | -0.457 | -0.196 | 0.149 |
| 4.976282763286062 | -0.457 | -0.197 | 0.149 |
| 4.979424355939651 | -0.457 | -0.198 | 0.149 |
| 4.982565948593241 | -0.457 | -0.199 | 0.148 |
| 4.985707541246831 | -0.457 | -0.2 | 0.148 |
| 4.98884913390042 | -0.457 | -0.201 | 0.147 |
| 4.99199072655401 | -0.457 | -0.202 | 0.147 |
| 4.9951323192076 | -0.457 | -0.203 | 0.147 |
| 4.99827391186119 | -0.457 | -0.204 | 0.146 |
| 5.00141550451478 | -0.457 | -0.205 | 0.146 |
| 5.004557097168369 | -0.457 | -0.206 | 0.145 |
| 5.007698689821958 | -0.457 | -0.207 | 0.145 |
| 5.010840282475548 | -0.457 | -0.208 | 0.144 |
| 5.013981875129137 | -0.457 | -0.209 | 0.144 |
| 5.017123467782727 | -0.457 | -0.209 | 0.143 |
| 5.020265060436317 | -0.457 | -0.21 | 0.142 |
| 5.023406653089906 | -0.457 | -0.211 | 0.142 |
| 5.026548245743496 | -0.457 | -0.212 | 0.141 |
| 5.029689838397085 | -0.457 | -0.212 | 0.14 |
| 5.032831431050674 | -0.457 | -0.213 | 0.14 |
| 5.035973023704264 | -0.457 | -0.214 | 0.139 |
| 5.039114616357854 | -0.457 | -0.214 | 0.138 |
| 5.042256209011444 | -0.457 | -0.215 | 0.137 |
| 5.045397801665033 | -0.457 | -0.216 | 0.136 |
| 5.048539394318622 | -0.457 | -0.216 | 0.135 |
| 5.051680986972213 | -0.457 | -0.217 | 0.134 |
| 5.054822579625802 | -0.457 | -0.217 | 0.133 |
| 5.057964172279392 | -0.457 | -0.218 | 0.132 |
| 5.061105764932981 | -0.457 | -0.218 | 0.131 |
| 5.064247357586571 | -0.457 | -0.219 | 0.13 |
| 5.067388950240161 | -0.457 | -0.219 | 0.129 |
| 5.07053054289375 | -0.457 | -0.22 | 0.127 |
| 5.07367213554734 | -0.457 | -0.22 | 0.126 |
| 5.07681372820093 | -0.457 | -0.22 | 0.125 |
| 5.079955320854519 | -0.457 | -0.221 | 0.123 |
| 5.083096913508108 | -0.457 | -0.221 | 0.122 |
| 5.086238506161698 | -0.457 | -0.222 | 0.12 |
| 5.089380098815288 | -0.457 | -0.222 | 0.119 |
| 5.092521691468877 | -0.457 | -0.222 | 0.117 |
| 5.095663284122466 | -0.457 | -0.223 | 0.116 |
| 5.098804876776057 | -0.457 | -0.223 | 0.114 |
| 5.101946469429646 | -0.457 | -0.223 | 0.112 |
| 5.105088062083236 | -0.457 | -0.223 | 0.11 |
| 5.108229654736825 | -0.457 | -0.224 | 0.109 |
| 5.111371247390415 | -0.457 | -0.224 | 0.107 |
| 5.114512840044005 | -0.457 | -0.224 | 0.105 |
| 5.117654432697594 | -0.457 | -0.225 | 0.103 |
| 5.120796025351184 | -0.457 | -0.225 | 0.101 |
| 5.123937618004773 | -0.457 | -0.225 | 0.099 |
| 5.127079210658363 | -0.457 | -0.225 | 0.097 |
| 5.130220803311953 | -0.457 | -0.225 | 0.094 |
| 5.133362395965542 | -0.457 | -0.226 | 0.092 |
| 5.136503988619131 | -0.457 | -0.226 | 0.09 |
| 5.13964558127272 | -0.457 | -0.226 | 0.088 |
| 5.142787173926311 | -0.457 | -0.226 | 0.085 |
| 5.1459287665799 | -0.457 | -0.226 | 0.083 |
| 5.14907035923349 | -0.457 | -0.226 | 0.08 |
| 5.15221195188708 | -0.457 | -0.226 | 0.078 |
| 5.15535354454067 | -0.457 | -0.227 | 0.075 |
| 5.158495137194259 | -0.457 | -0.227 | 0.073 |
| 5.161636729847848 | -0.457 | -0.227 | 0.07 |
| 5.164778322501438 | -0.457 | -0.227 | 0.068 |
| 5.167919915155028 | -0.457 | -0.227 | 0.065 |
| 5.171061507808617 | -0.457 | -0.227 | 0.062 |
| 5.174203100462206 | -0.457 | -0.227 | 0.059 |
| 5.177344693115796 | -0.457 | -0.227 | 0.057 |
| 5.180486285769386 | -0.457 | -0.227 | 0.054 |
| 5.183627878422976 | -0.457 | -0.228 | 0.051 |
| 5.186769471076565 | -0.457 | -0.228 | 0.048 |
| 5.189911063730155 | -0.457 | -0.228 | 0.045 |
| 5.193052656383744 | -0.457 | -0.228 | 0.042 |
| 5.196194249037334 | -0.457 | -0.228 | 0.039 |
| 5.199335841690924 | -0.457 | -0.228 | 0.036 |
| 5.202477434344513 | -0.457 | -0.228 | 0.033 |
| 5.205619026998103 | -0.457 | -0.228 | 0.03 |
| 5.208760619651692 | -0.457 | -0.228 | 0.027 |
| 5.211902212305282 | -0.457 | -0.228 | 0.024 |
| 5.215043804958871 | -0.457 | -0.228 | 0.021 |
| 5.218185397612461 | -0.457 | -0.228 | 0.018 |
| 5.221326990266051 | -0.457 | -0.228 | 0.015 |
| 5.22446858291964 | -0.457 | -0.228 | 0.012 |
| 5.22761017557323 | -0.457 | -0.228 | 0.008 |
| 5.23075176822682 | -0.457 | -0.228 | 0.005 |
| 5.23389336088041 | -0.457 | -0.228 | 0.002 |
| 5.237034953533999 | -0.457 | -0.228 | -0.001 |
| 5.240176546187588 | -0.457 | -0.228 | -0.004 |
| 5.243318138841178 | -0.457 | -0.228 | -0.007 |
| 5.246459731494767 | -0.457 | -0.228 | -0.01 |
| 5.249601324148357 | -0.456 | -0.228 | -0.014 |
| 5.252742916801947 | -0.456 | -0.228 | -0.017 |
| 5.255884509455536 | -0.456 | -0.228 | -0.02 |
| 5.259026102109125 | -0.456 | -0.228 | -0.023 |
| 5.262167694762715 | -0.456 | -0.228 | -0.026 |
| 5.265309287416305 | -0.456 | -0.228 | -0.029 |
| 5.268450880069895 | -0.456 | -0.228 | -0.032 |
| 5.271592472723484 | -0.456 | -0.228 | -0.035 |
| 5.274734065377074 | -0.456 | -0.228 | -0.038 |
| 5.277875658030664 | -0.456 | -0.228 | -0.041 |
| 5.281017250684253 | -0.456 | -0.229 | -0.044 |
| 5.284158843337843 | -0.456 | -0.229 | -0.047 |
| 5.287300435991432 | -0.456 | -0.229 | -0.05 |
| 5.290442028645022 | -0.456 | -0.229 | -0.053 |
| 5.293583621298612 | -0.456 | -0.229 | -0.056 |
| 5.296725213952201 | -0.456 | -0.229 | -0.058 |
| 5.299866806605791 | -0.456 | -0.229 | -0.061 |
| 5.30300839925938 | -0.456 | -0.229 | -0.064 |
| 5.30614999191297 | -0.456 | -0.229 | -0.067 |
| 5.30929158456656 | -0.456 | -0.229 | -0.069 |
| 5.312433177220149 | -0.456 | -0.229 | -0.072 |
| 5.315574769873739 | -0.456 | -0.229 | -0.075 |
| 5.318716362527328 | -0.456 | -0.229 | -0.077 |
| 5.321857955180918 | -0.455 | -0.229 | -0.08 |
| 5.324999547834508 | -0.455 | -0.229 | -0.082 |
| 5.328141140488097 | -0.455 | -0.229 | -0.085 |
| 5.331282733141686 | -0.455 | -0.229 | -0.087 |
| 5.334424325795276 | -0.455 | -0.229 | -0.089 |
| 5.337565918448866 | -0.455 | -0.229 | -0.091 |
| 5.340707511102456 | -0.455 | -0.229 | -0.094 |
| 5.343849103756045 | -0.455 | -0.229 | -0.096 |
| 5.346990696409634 | -0.455 | -0.229 | -0.098 |
| 5.350132289063224 | -0.455 | -0.229 | -0.1 |
| 5.353273881716814 | -0.455 | -0.229 | -0.102 |
| 5.356415474370403 | -0.455 | -0.229 | -0.104 |
| 5.359557067023993 | -0.455 | -0.229 | -0.106 |
| 5.362698659677583 | -0.454 | -0.229 | -0.108 |
| 5.365840252331172 | -0.454 | -0.229 | -0.11 |
| 5.368981844984762 | -0.454 | -0.229 | -0.112 |
| 5.372123437638351 | -0.454 | -0.229 | -0.113 |
| 5.375265030291941 | -0.454 | -0.229 | -0.115 |
| 5.378406622945531 | -0.454 | -0.229 | -0.117 |
| 5.38154821559912 | -0.454 | -0.229 | -0.118 |
| 5.38468980825271 | -0.454 | -0.229 | -0.12 |
| 5.387831400906299 | -0.454 | -0.229 | -0.121 |
| 5.39097299355989 | -0.453 | -0.229 | -0.123 |
| 5.394114586213479 | -0.453 | -0.229 | -0.124 |
| 5.397256178867068 | -0.453 | -0.229 | -0.126 |
| 5.400397771520657 | -0.453 | -0.229 | -0.127 |
| 5.403539364174247 | -0.453 | -0.229 | -0.128 |
| 5.406680956827837 | -0.453 | -0.229 | -0.129 |
| 5.409822549481426 | -0.453 | -0.229 | -0.131 |
| 5.412964142135016 | -0.453 | -0.229 | -0.132 |
| 5.416105734788605 | -0.452 | -0.229 | -0.133 |
| 5.419247327442195 | -0.452 | -0.229 | -0.134 |
| 5.422388920095785 | -0.452 | -0.229 | -0.135 |
| 5.425530512749375 | -0.452 | -0.229 | -0.136 |
| 5.428672105402964 | -0.452 | -0.229 | -0.137 |
| 5.431813698056554 | -0.452 | -0.229 | -0.138 |
| 5.434955290710143 | -0.451 | -0.229 | -0.139 |
| 5.438096883363733 | -0.451 | -0.229 | -0.139 |
| 5.441238476017322 | -0.451 | -0.229 | -0.14 |
| 5.444380068670912 | -0.451 | -0.229 | -0.141 |
| 5.447521661324502 | -0.451 | -0.229 | -0.142 |
| 5.450663253978091 | -0.451 | -0.229 | -0.142 |
| 5.453804846631681 | -0.45 | -0.229 | -0.143 |
| 5.456946439285271 | -0.45 | -0.229 | -0.144 |
| 5.46008803193886 | -0.45 | -0.229 | -0.144 |
| 5.46322962459245 | -0.45 | -0.229 | -0.145 |
| 5.466371217246039 | -0.449 | -0.229 | -0.145 |
| 5.46951280989963 | -0.449 | -0.229 | -0.146 |
| 5.472654402553218 | -0.449 | -0.229 | -0.146 |
| 5.475795995206808 | -0.449 | -0.229 | -0.147 |
| 5.478937587860398 | -0.449 | -0.229 | -0.147 |
| 5.482079180513987 | -0.448 | -0.229 | -0.147 |
| 5.485220773167577 | -0.448 | -0.229 | -0.148 |
| 5.488362365821166 | -0.448 | -0.229 | -0.148 |
| 5.491503958474756 | -0.448 | -0.229 | -0.148 |
| 5.494645551128346 | -0.447 | -0.229 | -0.149 |
| 5.497787143781935 | -0.447 | -0.229 | -0.149 |
| 5.500928736435525 | -0.447 | -0.229 | -0.149 |
| 5.504070329089115 | -0.446 | -0.229 | -0.15 |
| 5.507211921742704 | -0.446 | -0.229 | -0.15 |
| 5.510353514396294 | -0.446 | -0.229 | -0.15 |
| 5.513495107049883 | -0.446 | -0.229 | -0.15 |
| 5.516636699703473 | -0.445 | -0.229 | -0.15 |
| 5.519778292357062 | -0.445 | -0.229 | -0.151 |
| 5.522919885010652 | -0.445 | -0.229 | -0.151 |
| 5.526061477664242 | -0.444 | -0.229 | -0.151 |
| 5.529203070317831 | -0.444 | -0.229 | -0.151 |
| 5.532344662971421 | -0.444 | -0.229 | -0.151 |
| 5.535486255625011 | -0.443 | -0.229 | -0.151 |
| 5.5386278482786 | -0.443 | -0.229 | -0.151 |
| 5.54176944093219 | -0.442 | -0.229 | -0.151 |
| 5.544911033585779 | -0.442 | -0.229 | -0.152 |
| 5.54805262623937 | -0.442 | -0.229 | -0.152 |
| 5.551194218892959 | -0.441 | -0.229 | -0.152 |
| 5.554335811546548 | -0.441 | -0.229 | -0.152 |
| 5.557477404200137 | -0.441 | -0.229 | -0.152 |
| 5.560618996853727 | -0.44 | -0.229 | -0.152 |
| 5.563760589507317 | -0.44 | -0.229 | -0.152 |
| 5.566902182160906 | -0.439 | -0.229 | -0.152 |
| 5.570043774814496 | -0.439 | -0.229 | -0.152 |
| 5.573185367468086 | -0.438 | -0.229 | -0.152 |
| 5.576326960121675 | -0.438 | -0.229 | -0.152 |
| 5.579468552775264 | -0.437 | -0.229 | -0.152 |
| 5.582610145428854 | -0.437 | -0.229 | -0.152 |
| 5.585751738082444 | -0.436 | -0.229 | -0.152 |
| 5.588893330736034 | -0.436 | -0.229 | -0.152 |
| 5.592034923389623 | -0.435 | -0.229 | -0.152 |
| 5.595176516043213 | -0.435 | -0.229 | -0.152 |
| 5.598318108696803 | -0.434 | -0.229 | -0.152 |
| 5.601459701350392 | -0.434 | -0.229 | -0.152 |
| 5.604601294003982 | -0.433 | -0.229 | -0.152 |
| 5.607742886657571 | -0.433 | -0.229 | -0.152 |
| 5.610884479311161 | -0.432 | -0.229 | -0.152 |
| 5.61402607196475 | -0.432 | -0.229 | -0.152 |
| 5.61716766461834 | -0.431 | -0.229 | -0.152 |
| 5.62030925727193 | -0.431 | -0.229 | -0.152 |
| 5.623450849925519 | -0.43 | -0.229 | -0.152 |
| 5.626592442579109 | -0.429 | -0.229 | -0.152 |
| 5.629734035232698 | -0.429 | -0.229 | -0.152 |
| 5.632875627886288 | -0.428 | -0.229 | -0.152 |
| 5.636017220539878 | -0.427 | -0.229 | -0.152 |
| 5.639158813193467 | -0.427 | -0.229 | -0.152 |
| 5.642300405847057 | -0.426 | -0.229 | -0.152 |
| 5.645441998500646 | -0.425 | -0.229 | -0.152 |
| 5.648583591154236 | -0.425 | -0.229 | -0.152 |
| 5.651725183807825 | -0.424 | -0.229 | -0.152 |
| 5.654866776461415 | -0.423 | -0.229 | -0.152 |
| 5.658008369115005 | -0.423 | -0.229 | -0.152 |
| 5.661149961768594 | -0.422 | -0.229 | -0.152 |
| 5.664291554422184 | -0.421 | -0.229 | -0.152 |
| 5.667433147075774 | -0.42 | -0.229 | -0.152 |
| 5.670574739729363 | -0.42 | -0.229 | -0.152 |
| 5.673716332382953 | -0.419 | -0.229 | -0.152 |
| 5.676857925036542 | -0.418 | -0.229 | -0.152 |
| 5.679999517690132 | -0.417 | -0.229 | -0.152 |
| 5.683141110343721 | -0.416 | -0.229 | -0.152 |
| 5.686282702997311 | -0.416 | -0.229 | -0.152 |
| 5.689424295650901 | -0.415 | -0.229 | -0.152 |
| 5.69256588830449 | -0.414 | -0.229 | -0.152 |
| 5.69570748095808 | -0.413 | -0.229 | -0.152 |
| 5.69884907361167 | -0.412 | -0.229 | -0.152 |
| 5.701990666265259 | -0.411 | -0.229 | -0.152 |
| 5.705132258918849 | -0.41 | -0.229 | -0.152 |
| 5.708273851572438 | -0.409 | -0.229 | -0.152 |
| 5.711415444226028 | -0.409 | -0.229 | -0.152 |
| 5.714557036879618 | -0.408 | -0.229 | -0.152 |
| 5.717698629533207 | -0.407 | -0.228 | -0.152 |
| 5.720840222186797 | -0.406 | -0.228 | -0.152 |
| 5.723981814840386 | -0.405 | -0.228 | -0.152 |
| 5.727123407493976 | -0.404 | -0.228 | -0.152 |
| 5.730265000147565 | -0.403 | -0.228 | -0.152 |
| 5.733406592801155 | -0.402 | -0.228 | -0.152 |
| 5.736548185454744 | -0.401 | -0.228 | -0.152 |
| 5.739689778108334 | -0.4 | -0.228 | -0.152 |
| 5.742831370761924 | -0.399 | -0.228 | -0.152 |
| 5.745972963415514 | -0.397 | -0.228 | -0.152 |
| 5.749114556069103 | -0.396 | -0.228 | -0.152 |
| 5.752256148722693 | -0.395 | -0.228 | -0.152 |
| 5.755397741376282 | -0.394 | -0.228 | -0.152 |
| 5.758539334029872 | -0.393 | -0.228 | -0.152 |
| 5.761680926683462 | -0.392 | -0.228 | -0.152 |
| 5.764822519337051 | -0.391 | -0.228 | -0.152 |
| 5.767964111990641 | -0.39 | -0.228 | -0.152 |
| 5.77110570464423 | -0.388 | -0.228 | -0.152 |
| 5.77424729729782 | -0.387 | -0.228 | -0.152 |
| 5.77738888995141 | -0.386 | -0.228 | -0.152 |
| 5.780530482605 | -0.385 | -0.228 | -0.152 |
| 5.783672075258588 | -0.383 | -0.228 | -0.152 |
| 5.786813667912178 | -0.382 | -0.228 | -0.152 |
| 5.789955260565768 | -0.381 | -0.228 | -0.152 |
| 5.793096853219358 | -0.38 | -0.228 | -0.152 |
| 5.796238445872947 | -0.378 | -0.228 | -0.152 |
| 5.799380038526537 | -0.377 | -0.228 | -0.152 |
| 5.802521631180126 | -0.376 | -0.228 | -0.152 |
| 5.805663223833715 | -0.374 | -0.228 | -0.152 |
| 5.808804816487306 | -0.373 | -0.228 | -0.152 |
| 5.811946409140895 | -0.371 | -0.228 | -0.152 |
| 5.815088001794485 | -0.37 | -0.227 | -0.152 |
| 5.818229594448074 | -0.369 | -0.227 | -0.152 |
| 5.821371187101663 | -0.367 | -0.227 | -0.152 |
| 5.824512779755254 | -0.366 | -0.227 | -0.152 |
| 5.827654372408843 | -0.364 | -0.227 | -0.152 |
| 5.830795965062433 | -0.363 | -0.227 | -0.152 |
| 5.833937557716022 | -0.361 | -0.227 | -0.152 |
| 5.837079150369612 | -0.36 | -0.227 | -0.152 |
| 5.840220743023201 | -0.358 | -0.227 | -0.152 |
| 5.843362335676791 | -0.357 | -0.226 | -0.152 |
| 5.846503928330381 | -0.355 | -0.226 | -0.152 |
| 5.84964552098397 | -0.353 | -0.226 | -0.152 |
| 5.85278711363756 | -0.352 | -0.226 | -0.152 |
| 5.85592870629115 | -0.35 | -0.226 | -0.152 |
| 5.85907029894474 | -0.349 | -0.226 | -0.152 |
| 5.862211891598329 | -0.347 | -0.226 | -0.152 |
| 5.865353484251918 | -0.345 | -0.225 | -0.152 |
| 5.868495076905508 | -0.344 | -0.225 | -0.152 |
| 5.871636669559098 | -0.342 | -0.225 | -0.152 |
| 5.874778262212687 | -0.34 | -0.225 | -0.152 |
| 5.877919854866277 | -0.338 | -0.225 | -0.152 |
| 5.881061447519866 | -0.337 | -0.224 | -0.152 |
| 5.884203040173456 | -0.335 | -0.224 | -0.152 |
| 5.887344632827046 | -0.333 | -0.224 | -0.152 |
| 5.890486225480635 | -0.331 | -0.223 | -0.152 |
| 5.893627818134224 | -0.33 | -0.223 | -0.152 |
| 5.896769410787814 | -0.328 | -0.223 | -0.152 |
| 5.899911003441404 | -0.326 | -0.223 | -0.152 |
| 5.903052596094994 | -0.324 | -0.222 | -0.152 |
| 5.906194188748583 | -0.322 | -0.222 | -0.152 |
| 5.909335781402172 | -0.32 | -0.222 | -0.152 |
| 5.912477374055762 | -0.318 | -0.221 | -0.152 |
| 5.915618966709352 | -0.316 | -0.221 | -0.152 |
| 5.918760559362942 | -0.314 | -0.22 | -0.152 |
| 5.921902152016531 | -0.313 | -0.22 | -0.152 |
| 5.92504374467012 | -0.311 | -0.22 | -0.152 |
| 5.92818533732371 | -0.309 | -0.219 | -0.152 |
| 5.9313269299773 | -0.307 | -0.219 | -0.152 |
| 5.93446852263089 | -0.305 | -0.218 | -0.152 |
| 5.93761011528448 | -0.302 | -0.218 | -0.152 |
| 5.940751707938068 | -0.3 | -0.217 | -0.152 |
| 5.943893300591658 | -0.298 | -0.217 | -0.152 |
| 5.947034893245248 | -0.296 | -0.216 | -0.152 |
| 5.950176485898837 | -0.294 | -0.216 | -0.152 |
| 5.953318078552427 | -0.292 | -0.215 | -0.152 |
| 5.956459671206017 | -0.29 | -0.214 | -0.152 |
| 5.959601263859606 | -0.288 | -0.214 | -0.152 |
| 5.962742856513196 | -0.286 | -0.213 | -0.152 |
| 5.965884449166785 | -0.283 | -0.212 | -0.152 |
| 5.969026041820375 | -0.281 | -0.212 | -0.152 |
| 5.972167634473964 | -0.279 | -0.211 | -0.152 |
| 5.975309227127554 | -0.277 | -0.21 | -0.152 |
| 5.978450819781144 | -0.274 | -0.209 | -0.151 |
| 5.981592412434733 | -0.272 | -0.209 | -0.151 |
| 5.984734005088323 | -0.27 | -0.208 | -0.151 |
| 5.987875597741913 | -0.268 | -0.207 | -0.151 |
| 5.991017190395502 | -0.265 | -0.206 | -0.151 |
| 5.994158783049092 | -0.263 | -0.205 | -0.151 |
| 5.997300375702681 | -0.261 | -0.204 | -0.151 |
| 6.000441968356271 | -0.258 | -0.203 | -0.15 |
| 6.003583561009861 | -0.256 | -0.202 | -0.15 |
| 6.00672515366345 | -0.254 | -0.201 | -0.15 |
| 6.00986674631704 | -0.251 | -0.2 | -0.15 |
| 6.01300833897063 | -0.249 | -0.199 | -0.15 |
| 6.01614993162422 | -0.246 | -0.198 | -0.149 |
| 6.019291524277808 | -0.244 | -0.197 | -0.149 |
| 6.022433116931398 | -0.241 | -0.196 | -0.149 |
| 6.025574709584988 | -0.239 | -0.195 | -0.149 |
| 6.028716302238577 | -0.236 | -0.194 | -0.148 |
| 6.031857894892167 | -0.234 | -0.192 | -0.148 |
| 6.034999487545757 | -0.231 | -0.191 | -0.148 |
| 6.038141080199346 | -0.229 | -0.19 | -0.147 |
| 6.041282672852935 | -0.226 | -0.188 | -0.147 |
| 6.044424265506525 | -0.224 | -0.187 | -0.146 |
| 6.047565858160115 | -0.221 | -0.186 | -0.146 |
| 6.050707450813704 | -0.219 | -0.184 | -0.145 |
| 6.053849043467294 | -0.216 | -0.183 | -0.145 |
| 6.056990636120884 | -0.213 | -0.181 | -0.144 |
| 6.060132228774473 | -0.211 | -0.18 | -0.144 |
| 6.063273821428063 | -0.208 | -0.178 | -0.143 |
| 6.066415414081653 | -0.205 | -0.177 | -0.143 |
| 6.069557006735242 | -0.203 | -0.175 | -0.142 |
| 6.072698599388831 | -0.2 | -0.173 | -0.141 |
| 6.07584019204242 | -0.197 | -0.172 | -0.141 |
| 6.078981784696011 | -0.195 | -0.17 | -0.14 |
| 6.082123377349601 | -0.192 | -0.168 | -0.139 |
| 6.08526497000319 | -0.189 | -0.167 | -0.138 |
| 6.08840656265678 | -0.186 | -0.165 | -0.137 |
| 6.09154815531037 | -0.184 | -0.163 | -0.136 |
| 6.094689747963959 | -0.181 | -0.161 | -0.136 |
| 6.097831340617549 | -0.178 | -0.159 | -0.135 |
| 6.100972933271138 | -0.175 | -0.157 | -0.134 |
| 6.104114525924728 | -0.173 | -0.155 | -0.132 |
| 6.107256118578317 | -0.17 | -0.153 | -0.131 |
| 6.110397711231907 | -0.167 | -0.151 | -0.13 |
| 6.113539303885497 | -0.164 | -0.149 | -0.129 |
| 6.116680896539086 | -0.161 | -0.147 | -0.128 |
| 6.119822489192675 | -0.158 | -0.145 | -0.127 |
| 6.122964081846265 | -0.156 | -0.143 | -0.125 |
| 6.126105674499855 | -0.153 | -0.141 | -0.124 |
| 6.129247267153445 | -0.15 | -0.138 | -0.122 |
| 6.132388859807034 | -0.147 | -0.136 | -0.121 |
| 6.135530452460624 | -0.144 | -0.134 | -0.119 |
| 6.138672045114213 | -0.141 | -0.131 | -0.118 |
| 6.141813637767803 | -0.138 | -0.129 | -0.116 |
| 6.144955230421393 | -0.135 | -0.127 | -0.115 |
| 6.148096823074982 | -0.132 | -0.124 | -0.113 |
| 6.151238415728571 | -0.129 | -0.122 | -0.111 |
| 6.154380008382161 | -0.126 | -0.119 | -0.109 |
| 6.157521601035751 | -0.123 | -0.117 | -0.107 |
| 6.16066319368934 | -0.12 | -0.114 | -0.105 |
| 6.16380478634293 | -0.117 | -0.112 | -0.104 |
| 6.16694637899652 | -0.114 | -0.109 | -0.102 |
| 6.170087971650109 | -0.111 | -0.107 | -0.099 |
| 6.173229564303698 | -0.108 | -0.104 | -0.097 |
| 6.176371156957289 | -0.105 | -0.101 | -0.095 |
| 6.179512749610878 | -0.102 | -0.099 | -0.093 |
| 6.182654342264468 | -0.099 | -0.096 | -0.091 |
| 6.185795934918057 | -0.096 | -0.093 | -0.088 |
| 6.188937527571647 | -0.093 | -0.09 | -0.086 |
| 6.192079120225237 | -0.09 | -0.088 | -0.084 |
| 6.195220712878826 | -0.087 | -0.085 | -0.081 |
| 6.198362305532415 | -0.084 | -0.082 | -0.079 |
| 6.201503898186005 | -0.081 | -0.079 | -0.076 |
| 6.204645490839594 | -0.078 | -0.076 | -0.074 |
| 6.207787083493184 | -0.075 | -0.073 | -0.071 |
| 6.210928676146774 | -0.072 | -0.071 | -0.068 |
| 6.214070268800364 | -0.069 | -0.068 | -0.066 |
| 6.217211861453953 | -0.066 | -0.065 | -0.063 |
| 6.220353454107543 | -0.063 | -0.062 | -0.06 |
| 6.223495046761133 | -0.059 | -0.059 | -0.058 |
| 6.226636639414722 | -0.056 | -0.056 | -0.055 |
| 6.229778232068312 | -0.053 | -0.053 | -0.052 |
| 6.232919824721901 | -0.05 | -0.05 | -0.049 |
| 6.236061417375491 | -0.047 | -0.047 | -0.046 |
| 6.23920301002908 | -0.044 | -0.044 | -0.043 |
| 6.24234460268267 | -0.041 | -0.041 | -0.04 |
| 6.24548619533626 | -0.038 | -0.037 | -0.037 |
| 6.24862778798985 | -0.035 | -0.034 | -0.034 |
| 6.251769380643438 | -0.031 | -0.031 | -0.031 |
| 6.254910973297028 | -0.028 | -0.028 | -0.028 |
| 6.258052565950618 | -0.025 | -0.025 | -0.025 |
| 6.261194158604208 | -0.022 | -0.022 | -0.022 |
| 6.264335751257797 | -0.019 | -0.019 | -0.019 |
| 6.267477343911387 | -0.016 | -0.016 | -0.016 |
| 6.270618936564976 | -0.013 | -0.013 | -0.013 |
| 6.273760529218566 | -0.009 | -0.009 | -0.009 |
| 6.276902121872155 | -0.006 | -0.006 | -0.006 |
| 6.280043714525745 | -0.003 | -0.003 | -0.003 |
| 6.283185307179335 | 0 | 0 | 0 |